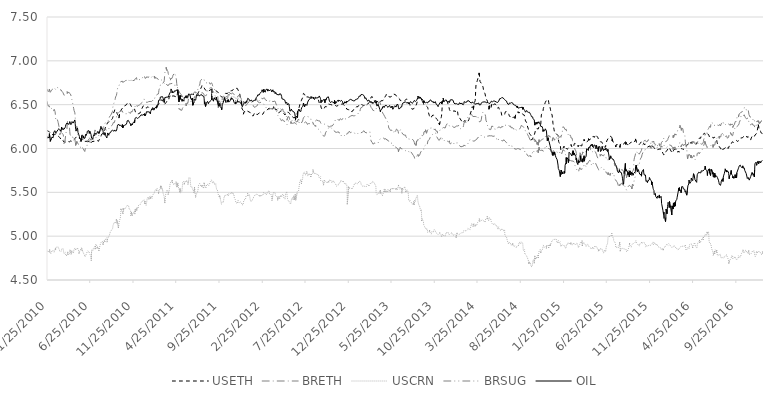
| Category | USETH | BRETH | USCRN | BRSUG | OIL |
|---|---|---|---|---|---|
| 1/25/10 | 6.204 | 6.535 | 4.828 | 6.676 | 6.138 |
| 1/26/10 | 6.201 | 6.519 | 4.837 | 6.667 | 6.133 |
| 1/27/10 | 6.206 | 6.496 | 4.819 | 6.652 | 6.118 |
| 1/28/10 | 6.203 | 6.484 | 4.819 | 6.648 | 6.117 |
| 1/29/10 | 6.197 | 6.479 | 4.831 | 6.642 | 6.107 |
| 2/1/10 | 6.193 | 6.488 | 4.816 | 6.654 | 6.13 |
| 2/2/10 | 6.191 | 6.498 | 4.822 | 6.674 | 6.17 |
| 2/3/10 | 6.186 | 6.484 | 4.842 | 6.663 | 6.168 |
| 2/4/10 | 6.19 | 6.458 | 4.807 | 6.642 | 6.117 |
| 2/5/10 | 6.178 | 6.445 | 4.81 | 6.642 | 6.081 |
| 2/8/10 | 6.171 | 6.452 | 4.804 | 6.652 | 6.088 |
| 2/9/10 | 6.172 | 6.455 | 4.816 | 6.665 | 6.117 |
| 2/10/10 | 6.162 | 6.445 | 4.825 | 6.664 | 6.122 |
| 2/11/10 | 6.159 | 6.445 | 4.834 | 6.664 | 6.129 |
| 2/12/10 | 6.16 | 6.428 | 4.837 | 6.657 | 6.127 |
| 2/15/10 | 6.16 | 6.434 | 4.834 | 6.681 | 6.122 |
| 2/18/10 | 6.157 | 6.433 | 4.828 | 6.681 | 6.192 |
| 2/19/10 | 6.157 | 6.447 | 4.819 | 6.694 | 6.197 |
| 2/22/10 | 6.165 | 6.421 | 4.828 | 6.686 | 6.203 |
| 2/23/10 | 6.162 | 6.392 | 4.862 | 6.677 | 6.185 |
| 2/24/10 | 6.164 | 6.341 | 4.851 | 6.677 | 6.196 |
| 2/25/10 | 6.159 | 6.337 | 4.871 | 6.679 | 6.173 |
| 2/26/10 | 6.155 | 6.352 | 4.86 | 6.691 | 6.19 |
| 3/1/10 | 6.155 | 6.339 | 4.877 | 6.694 | 6.181 |
| 3/2/10 | 6.148 | 6.35 | 4.871 | 6.701 | 6.197 |
| 3/3/10 | 6.152 | 6.335 | 4.871 | 6.695 | 6.211 |
| 3/4/10 | 6.143 | 6.31 | 4.885 | 6.688 | 6.202 |
| 3/5/10 | 6.139 | 6.296 | 4.874 | 6.689 | 6.219 |
| 3/8/10 | 6.135 | 6.25 | 4.854 | 6.679 | 6.226 |
| 3/9/10 | 6.134 | 6.216 | 4.851 | 6.679 | 6.219 |
| 3/10/10 | 6.131 | 6.193 | 4.834 | 6.666 | 6.226 |
| 3/11/10 | 6.123 | 6.161 | 4.825 | 6.673 | 6.224 |
| 3/12/10 | 6.116 | 6.173 | 4.828 | 6.667 | 6.213 |
| 3/15/10 | 6.105 | 6.172 | 4.825 | 6.67 | 6.193 |
| 3/16/10 | 6.095 | 6.182 | 4.822 | 6.667 | 6.208 |
| 3/17/10 | 6.087 | 6.176 | 4.834 | 6.665 | 6.244 |
| 3/18/10 | 6.083 | 6.179 | 4.854 | 6.653 | 6.238 |
| 3/19/10 | 6.086 | 6.171 | 4.862 | 6.645 | 6.219 |
| 3/22/10 | 6.09 | 6.165 | 4.86 | 6.637 | 6.227 |
| 3/23/10 | 6.088 | 6.16 | 4.848 | 6.641 | 6.229 |
| 3/24/10 | 6.082 | 6.153 | 4.825 | 6.63 | 6.215 |
| 3/25/10 | 6.075 | 6.089 | 4.831 | 6.629 | 6.215 |
| 3/26/10 | 6.072 | 6.06 | 4.801 | 6.607 | 6.211 |
| 3/29/10 | 6.069 | 6.085 | 4.804 | 6.616 | 6.235 |
| 3/30/10 | 6.067 | 6.09 | 4.813 | 6.613 | 6.236 |
| 3/31/10 | 6.07 | 6.138 | 4.807 | 6.625 | 6.253 |
| 4/1/10 | 6.074 | 6.168 | 4.78 | 6.633 | 6.269 |
| 4/5/10 | 6.083 | 6.225 | 4.78 | 6.629 | 6.291 |
| 4/6/10 | 6.08 | 6.274 | 4.783 | 6.646 | 6.294 |
| 4/7/10 | 6.083 | 6.311 | 4.786 | 6.632 | 6.288 |
| 4/8/10 | 6.084 | 6.302 | 4.816 | 6.64 | 6.279 |
| 4/9/10 | 6.081 | 6.305 | 4.789 | 6.638 | 6.279 |
| 4/12/10 | 6.073 | 6.297 | 4.783 | 6.642 | 6.278 |
| 4/13/10 | 6.074 | 6.267 | 4.795 | 6.641 | 6.277 |
| 4/14/10 | 6.076 | 6.239 | 4.81 | 6.642 | 6.294 |
| 4/15/10 | 6.078 | 6.195 | 4.825 | 6.628 | 6.306 |
| 4/16/10 | 6.083 | 6.162 | 4.839 | 6.621 | 6.292 |
| 4/19/10 | 6.088 | 6.141 | 4.842 | 6.611 | 6.272 |
| 4/20/10 | 6.081 | 6.123 | 4.798 | 6.573 | 6.278 |
| 4/22/10 | 6.081 | 6.114 | 4.837 | 6.563 | 6.289 |
| 4/23/10 | 6.078 | 6.126 | 4.845 | 6.555 | 6.307 |
| 4/26/10 | 6.081 | 6.13 | 4.819 | 6.503 | 6.302 |
| 4/27/10 | 6.087 | 6.107 | 4.816 | 6.483 | 6.29 |
| 4/28/10 | 6.09 | 6.112 | 4.804 | 6.485 | 6.294 |
| 4/29/10 | 6.099 | 6.119 | 4.831 | 6.455 | 6.303 |
| 4/30/10 | 6.104 | 6.108 | 4.845 | 6.435 | 6.309 |
| 5/3/10 | 6.112 | 6.112 | 4.862 | 6.407 | 6.326 |
| 5/4/10 | 6.122 | 6.084 | 4.854 | 6.37 | 6.289 |
| 5/5/10 | 6.124 | 6.065 | 4.845 | 6.311 | 6.252 |
| 5/6/10 | 6.127 | 6.037 | 4.857 | 6.253 | 6.218 |
| 5/7/10 | 6.128 | 6.032 | 4.851 | 6.239 | 6.198 |
| 5/10/10 | 6.129 | 6.08 | 4.854 | 6.253 | 6.222 |
| 5/11/10 | 6.126 | 6.073 | 4.851 | 6.187 | 6.226 |
| 5/12/10 | 6.125 | 6.072 | 4.868 | 6.185 | 6.235 |
| 5/13/10 | 6.126 | 6.07 | 4.871 | 6.171 | 6.222 |
| 5/14/10 | 6.124 | 6.053 | 4.857 | 6.15 | 6.184 |
| 5/17/10 | 6.117 | 6.047 | 4.828 | 6.133 | 6.157 |
| 5/18/10 | 6.116 | 6.044 | 4.807 | 6.119 | 6.148 |
| 5/19/10 | 6.113 | 6.038 | 4.819 | 6.096 | 6.138 |
| 5/20/10 | 6.112 | 6.016 | 4.816 | 6.079 | 6.113 |
| 5/21/10 | 6.11 | 6.015 | 4.834 | 6.081 | 6.11 |
| 5/24/10 | 6.11 | 6.014 | 4.854 | 6.088 | 6.103 |
| 5/25/10 | 6.108 | 6.001 | 4.86 | 6.09 | 6.08 |
| 5/26/10 | 6.103 | 6.002 | 4.839 | 6.098 | 6.111 |
| 5/27/10 | 6.103 | 6.007 | 4.862 | 6.113 | 6.151 |
| 5/28/10 | 6.103 | 6.013 | 4.865 | 6.126 | 6.142 |
| 5/31/10 | 6.102 | 6.017 | 4.825 | 6.116 | 6.151 |
| 6/1/10 | 6.101 | 6.001 | 4.817 | 6.098 | 6.125 |
| 6/2/10 | 6.098 | 6.008 | 4.81 | 6.098 | 6.139 |
| 6/4/10 | 6.085 | 5.982 | 4.807 | 6.073 | 6.116 |
| 6/7/10 | 6.078 | 5.966 | 4.776 | 6.067 | 6.116 |
| 6/8/10 | 6.08 | 5.984 | 4.764 | 6.084 | 6.119 |
| 6/9/10 | 6.072 | 5.992 | 4.767 | 6.084 | 6.146 |
| 6/10/10 | 6.069 | 6.008 | 4.77 | 6.109 | 6.159 |
| 6/11/10 | 6.071 | 6.011 | 4.786 | 6.099 | 6.147 |
| 6/14/10 | 6.079 | 6.02 | 4.807 | 6.092 | 6.158 |
| 6/15/10 | 6.079 | 6.032 | 4.819 | 6.101 | 6.172 |
| 6/16/10 | 6.08 | 6.075 | 4.819 | 6.112 | 6.197 |
| 6/17/10 | 6.08 | 6.087 | 4.825 | 6.112 | 6.204 |
| 6/18/10 | 6.078 | 6.098 | 4.831 | 6.121 | 6.198 |
| 6/21/10 | 6.082 | 6.106 | 4.839 | 6.119 | 6.205 |
| 6/22/10 | 6.08 | 6.093 | 4.822 | 6.114 | 6.195 |
| 6/23/10 | 6.076 | 6.082 | 4.813 | 6.109 | 6.172 |
| 6/24/10 | 6.071 | 6.072 | 4.798 | 6.113 | 6.175 |
| 6/25/10 | 6.065 | 6.075 | 4.792 | 6.117 | 6.196 |
| 6/28/10 | 6.064 | 6.072 | 4.78 | 6.118 | 6.19 |
| 6/29/10 | 6.061 | 6.061 | 4.755 | 6.093 | 6.161 |
| 6/30/10 | 6.063 | 6.071 | 4.726 | 6.1 | 6.156 |
| 7/1/10 | 6.068 | 6.074 | 4.819 | 6.104 | 6.12 |
| 7/2/10 | 6.077 | 6.069 | 4.848 | 6.116 | 6.11 |
| 7/5/10 | 6.082 | 6.088 | 4.848 | 6.118 | 6.107 |
| 7/6/10 | 6.081 | 6.105 | 4.841 | 6.107 | 6.107 |
| 7/7/10 | 6.076 | 6.14 | 4.834 | 6.123 | 6.136 |
| 7/8/10 | 6.076 | 6.144 | 4.862 | 6.12 | 6.152 |
| 7/12/10 | 6.082 | 6.186 | 4.882 | 6.122 | 6.147 |
| 7/13/10 | 6.086 | 6.212 | 4.871 | 6.129 | 6.177 |
| 7/14/10 | 6.083 | 6.217 | 4.857 | 6.125 | 6.179 |
| 7/15/10 | 6.086 | 6.211 | 4.882 | 6.125 | 6.171 |
| 7/16/10 | 6.09 | 6.195 | 4.907 | 6.123 | 6.161 |
| 7/19/10 | 6.091 | 6.194 | 4.912 | 6.126 | 6.164 |
| 7/20/10 | 6.093 | 6.202 | 4.888 | 6.137 | 6.172 |
| 7/21/10 | 6.089 | 6.189 | 4.865 | 6.133 | 6.161 |
| 7/22/10 | 6.087 | 6.193 | 4.882 | 6.149 | 6.193 |
| 7/23/10 | 6.086 | 6.193 | 4.874 | 6.148 | 6.188 |
| 7/26/10 | 6.083 | 6.185 | 4.857 | 6.145 | 6.188 |
| 7/27/10 | 6.095 | 6.174 | 4.837 | 6.151 | 6.171 |
| 7/28/10 | 6.088 | 6.175 | 4.834 | 6.164 | 6.17 |
| 7/29/10 | 6.098 | 6.194 | 4.871 | 6.181 | 6.19 |
| 7/30/10 | 6.11 | 6.211 | 4.879 | 6.197 | 6.197 |
| 8/2/10 | 6.122 | 6.233 | 4.918 | 6.196 | 6.23 |
| 8/3/10 | 6.131 | 6.229 | 4.912 | 6.203 | 6.253 |
| 8/4/10 | 6.148 | 6.233 | 4.91 | 6.226 | 6.247 |
| 8/5/10 | 6.158 | 6.235 | 4.936 | 6.229 | 6.24 |
| 8/6/10 | 6.164 | 6.23 | 4.934 | 6.228 | 6.222 |
| 8/9/10 | 6.167 | 6.232 | 4.936 | 6.231 | 6.232 |
| 8/10/10 | 6.17 | 6.224 | 4.931 | 6.232 | 6.215 |
| 8/11/10 | 6.173 | 6.217 | 4.907 | 6.227 | 6.19 |
| 8/12/10 | 6.176 | 6.217 | 4.912 | 6.243 | 6.163 |
| 8/13/10 | 6.185 | 6.216 | 4.939 | 6.246 | 6.157 |
| 8/16/10 | 6.194 | 6.224 | 4.955 | 6.278 | 6.154 |
| 8/17/10 | 6.212 | 6.22 | 4.939 | 6.285 | 6.181 |
| 8/18/10 | 6.229 | 6.225 | 4.957 | 6.287 | 6.175 |
| 8/19/10 | 6.242 | 6.222 | 4.968 | 6.295 | 6.16 |
| 8/20/10 | 6.26 | 6.216 | 4.955 | 6.297 | 6.146 |
| 8/23/10 | 6.263 | 6.212 | 4.98 | 6.298 | 6.137 |
| 8/24/10 | 6.273 | 6.207 | 4.968 | 6.298 | 6.12 |
| 8/25/10 | 6.284 | 6.207 | 4.936 | 6.305 | 6.135 |
| 8/26/10 | 6.29 | 6.219 | 4.936 | 6.312 | 6.156 |
| 8/27/10 | 6.292 | 6.224 | 4.973 | 6.316 | 6.177 |
| 8/30/10 | 6.303 | 6.218 | 4.983 | 6.318 | 6.177 |
| 8/31/10 | 6.308 | 6.219 | 4.998 | 6.333 | 6.151 |
| 9/1/10 | 6.305 | 6.226 | 4.99 | 6.345 | 6.173 |
| 9/2/10 | 6.307 | 6.24 | 5.01 | 6.36 | 6.181 |
| 9/3/10 | 6.307 | 6.24 | 5.015 | 6.369 | 6.178 |
| 9/6/10 | 6.31 | 6.248 | 5.056 | 6.377 | 6.18 |
| 9/8/10 | 6.315 | 6.25 | 5.058 | 6.385 | 6.197 |
| 9/9/10 | 6.322 | 6.253 | 5.051 | 6.393 | 6.188 |
| 9/10/10 | 6.331 | 6.26 | 5.07 | 6.403 | 6.197 |
| 9/13/10 | 6.343 | 6.269 | 5.086 | 6.424 | 6.208 |
| 9/14/10 | 6.357 | 6.278 | 5.099 | 6.468 | 6.21 |
| 9/15/10 | 6.364 | 6.274 | 5.123 | 6.47 | 6.206 |
| 9/16/10 | 6.373 | 6.297 | 5.123 | 6.494 | 6.201 |
| 9/17/10 | 6.407 | 6.297 | 5.126 | 6.509 | 6.198 |
| 9/20/10 | 6.428 | 6.297 | 5.162 | 6.519 | 6.212 |
| 9/21/10 | 6.443 | 6.317 | 5.158 | 6.538 | 6.2 |
| 9/22/10 | 6.443 | 6.317 | 5.152 | 6.554 | 6.194 |
| 9/23/10 | 6.443 | 6.321 | 5.152 | 6.573 | 6.196 |
| 9/24/10 | 6.439 | 6.332 | 5.147 | 6.589 | 6.206 |
| 9/27/10 | 6.426 | 6.358 | 5.187 | 6.606 | 6.202 |
| 9/28/10 | 6.417 | 6.384 | 5.168 | 6.625 | 6.204 |
| 9/29/10 | 6.401 | 6.394 | 5.152 | 6.647 | 6.23 |
| 9/30/10 | 6.392 | 6.402 | 5.173 | 6.664 | 6.249 |
| 10/1/10 | 6.387 | 6.407 | 5.164 | 6.687 | 6.266 |
| 10/4/10 | 6.373 | 6.407 | 5.099 | 6.686 | 6.26 |
| 10/5/10 | 6.366 | 6.418 | 5.112 | 6.709 | 6.279 |
| 10/6/10 | 6.351 | 6.412 | 5.154 | 6.715 | 6.281 |
| 10/7/10 | 6.35 | 6.41 | 5.143 | 6.725 | 6.262 |
| 10/8/10 | 6.392 | 6.419 | 5.162 | 6.753 | 6.269 |
| 10/11/10 | 6.408 | 6.419 | 5.213 | 6.753 | 6.266 |
| 10/13/10 | 6.438 | 6.431 | 5.307 | 6.763 | 6.277 |
| 10/14/10 | 6.438 | 6.426 | 5.292 | 6.759 | 6.275 |
| 10/15/10 | 6.449 | 6.426 | 5.289 | 6.762 | 6.25 |
| 10/18/10 | 6.46 | 6.428 | 5.281 | 6.768 | 6.273 |
| 10/19/10 | 6.462 | 6.414 | 5.275 | 6.755 | 6.234 |
| 10/20/10 | 6.467 | 6.418 | 5.26 | 6.763 | 6.264 |
| 10/21/10 | 6.468 | 6.406 | 5.312 | 6.754 | 6.243 |
| 10/22/10 | 6.482 | 6.401 | 5.294 | 6.755 | 6.256 |
| 10/25/10 | 6.484 | 6.4 | 5.287 | 6.764 | 6.263 |
| 10/26/10 | 6.487 | 6.396 | 5.303 | 6.76 | 6.265 |
| 10/27/10 | 6.486 | 6.389 | 5.307 | 6.754 | 6.26 |
| 10/28/10 | 6.488 | 6.393 | 5.325 | 6.767 | 6.264 |
| 10/29/10 | 6.493 | 6.399 | 5.329 | 6.774 | 6.259 |
| 11/1/10 | 6.498 | 6.397 | 5.334 | 6.773 | 6.276 |
| 11/3/10 | 6.508 | 6.402 | 5.323 | 6.778 | 6.297 |
| 11/4/10 | 6.514 | 6.417 | 5.337 | 6.786 | 6.315 |
| 11/5/10 | 6.517 | 6.415 | 5.353 | 6.792 | 6.317 |
| 11/8/10 | 6.521 | 6.414 | 5.35 | 6.797 | 6.321 |
| 11/9/10 | 6.525 | 6.417 | 5.344 | 6.783 | 6.319 |
| 11/10/10 | 6.529 | 6.414 | 5.329 | 6.788 | 6.326 |
| 11/11/10 | 6.526 | 6.41 | 5.312 | 6.788 | 6.325 |
| 11/12/10 | 6.521 | 6.408 | 5.307 | 6.77 | 6.296 |
| 11/16/10 | 6.5 | 6.402 | 5.292 | 6.76 | 6.278 |
| 11/17/10 | 6.494 | 6.41 | 5.237 | 6.769 | 6.26 |
| 11/18/10 | 6.483 | 6.422 | 5.241 | 6.782 | 6.281 |
| 11/19/10 | 6.477 | 6.42 | 5.272 | 6.769 | 6.273 |
| 11/22/10 | 6.47 | 6.42 | 5.231 | 6.761 | 6.268 |
| 11/23/10 | 6.466 | 6.433 | 5.221 | 6.761 | 6.26 |
| 11/24/10 | 6.463 | 6.442 | 5.253 | 6.775 | 6.291 |
| 11/25/10 | 6.461 | 6.448 | 5.272 | 6.784 | 6.294 |
| 11/26/10 | 6.461 | 6.447 | 5.272 | 6.78 | 6.288 |
| 11/29/10 | 6.459 | 6.459 | 5.272 | 6.776 | 6.308 |
| 11/30/10 | 6.45 | 6.464 | 5.274 | 6.781 | 6.292 |
| 12/1/10 | 6.438 | 6.471 | 5.256 | 6.786 | 6.325 |
| 12/2/10 | 6.432 | 6.48 | 5.298 | 6.779 | 6.346 |
| 12/3/10 | 6.418 | 6.493 | 5.283 | 6.798 | 6.354 |
| 12/6/10 | 6.411 | 6.503 | 5.32 | 6.806 | 6.354 |
| 12/7/10 | 6.411 | 6.503 | 5.309 | 6.809 | 6.353 |
| 12/8/10 | 6.406 | 6.494 | 5.298 | 6.789 | 6.346 |
| 12/9/10 | 6.403 | 6.48 | 5.321 | 6.781 | 6.349 |
| 12/10/10 | 6.393 | 6.478 | 5.321 | 6.773 | 6.343 |
| 12/13/10 | 6.392 | 6.489 | 5.32 | 6.779 | 6.351 |
| 12/14/10 | 6.397 | 6.492 | 5.35 | 6.786 | 6.351 |
| 12/15/10 | 6.404 | 6.494 | 5.348 | 6.784 | 6.362 |
| 12/16/10 | 6.405 | 6.494 | 5.341 | 6.777 | 6.357 |
| 12/17/10 | 6.404 | 6.496 | 5.348 | 6.777 | 6.356 |
| 12/20/10 | 6.407 | 6.503 | 5.362 | 6.786 | 6.368 |
| 12/21/10 | 6.414 | 6.509 | 5.367 | 6.792 | 6.373 |
| 12/22/10 | 6.432 | 6.51 | 5.372 | 6.801 | 6.378 |
| 12/23/10 | 6.447 | 6.517 | 5.384 | 6.797 | 6.384 |
| 12/27/10 | 6.46 | 6.526 | 5.393 | 6.802 | 6.38 |
| 12/28/10 | 6.467 | 6.525 | 5.394 | 6.804 | 6.385 |
| 12/29/10 | 6.48 | 6.547 | 5.407 | 6.814 | 6.383 |
| 12/30/10 | 6.48 | 6.558 | 5.407 | 6.822 | 6.372 |
| 1/3/11 | 6.488 | 6.561 | 5.411 | 6.831 | 6.39 |
| 1/4/11 | 6.487 | 6.553 | 5.397 | 6.82 | 6.376 |
| 1/5/11 | 6.486 | 6.54 | 5.377 | 6.815 | 6.397 |
| 1/6/11 | 6.482 | 6.529 | 5.394 | 6.801 | 6.387 |
| 1/7/11 | 6.468 | 6.533 | 5.365 | 6.803 | 6.374 |
| 1/10/11 | 6.464 | 6.528 | 5.353 | 6.805 | 6.399 |
| 1/11/11 | 6.46 | 6.528 | 5.374 | 6.804 | 6.419 |
| 1/12/11 | 6.464 | 6.533 | 5.374 | 6.816 | 6.424 |
| 1/13/11 | 6.471 | 6.537 | 5.414 | 6.821 | 6.424 |
| 1/14/11 | 6.475 | 6.527 | 5.433 | 6.814 | 6.43 |
| 1/17/11 | 6.471 | 6.531 | 5.443 | 6.807 | 6.417 |
| 1/18/11 | 6.472 | 6.534 | 5.449 | 6.814 | 6.421 |
| 1/19/11 | 6.47 | 6.538 | 5.456 | 6.82 | 6.425 |
| 1/20/11 | 6.464 | 6.541 | 5.425 | 6.825 | 6.409 |
| 1/21/11 | 6.46 | 6.544 | 5.446 | 6.822 | 6.419 |
| 1/24/11 | 6.459 | 6.537 | 5.454 | 6.819 | 6.409 |
| 1/25/11 | 6.458 | 6.542 | 5.451 | 6.814 | 6.395 |
| 1/26/11 | 6.453 | 6.547 | 5.433 | 6.821 | 6.422 |
| 1/27/11 | 6.447 | 6.536 | 5.456 | 6.809 | 6.417 |
| 1/28/11 | 6.446 | 6.534 | 5.445 | 6.808 | 6.437 |
| 1/31/11 | 6.444 | 6.541 | 5.433 | 6.81 | 6.453 |
| 2/1/11 | 6.445 | 6.547 | 5.459 | 6.824 | 6.461 |
| 2/2/11 | 6.443 | 6.549 | 5.468 | 6.826 | 6.466 |
| 2/3/11 | 6.445 | 6.546 | 5.473 | 6.826 | 6.461 |
| 2/4/11 | 6.454 | 6.546 | 5.465 | 6.823 | 6.442 |
| 2/7/11 | 6.456 | 6.546 | 5.49 | 6.807 | 6.436 |
| 2/8/11 | 6.459 | 6.563 | 5.483 | 6.823 | 6.443 |
| 2/9/11 | 6.466 | 6.573 | 5.482 | 6.816 | 6.461 |
| 2/10/11 | 6.473 | 6.582 | 5.518 | 6.801 | 6.452 |
| 2/11/11 | 6.477 | 6.595 | 5.519 | 6.814 | 6.458 |
| 2/14/11 | 6.48 | 6.598 | 5.531 | 6.809 | 6.474 |
| 2/15/11 | 6.479 | 6.601 | 5.515 | 6.805 | 6.46 |
| 2/16/11 | 6.479 | 6.605 | 5.511 | 6.797 | 6.48 |
| 2/17/11 | 6.481 | 6.612 | 5.511 | 6.803 | 6.469 |
| 2/18/11 | 6.496 | 6.618 | 5.543 | 6.798 | 6.468 |
| 2/21/11 | 6.501 | 6.621 | 5.538 | 6.793 | 6.499 |
| 2/22/11 | 6.503 | 6.621 | 5.515 | 6.79 | 6.5 |
| 2/23/11 | 6.503 | 6.636 | 5.491 | 6.782 | 6.55 |
| 2/24/11 | 6.5 | 6.662 | 5.509 | 6.772 | 6.551 |
| 2/25/11 | 6.509 | 6.677 | 5.5 | 6.774 | 6.558 |
| 2/28/11 | 6.519 | 6.699 | 5.541 | 6.777 | 6.555 |
| 3/1/11 | 6.53 | 6.717 | 5.554 | 6.776 | 6.587 |
| 3/2/11 | 6.534 | 6.732 | 5.568 | 6.788 | 6.595 |
| 3/3/11 | 6.542 | 6.743 | 5.548 | 6.783 | 6.581 |
| 3/4/11 | 6.553 | 6.743 | 5.57 | 6.785 | 6.591 |
| 3/9/11 | 6.553 | 6.735 | 5.525 | 6.771 | 6.591 |
| 3/10/11 | 6.545 | 6.749 | 5.518 | 6.767 | 6.587 |
| 3/11/11 | 6.535 | 6.755 | 5.488 | 6.758 | 6.573 |
| 3/14/11 | 6.526 | 6.759 | 5.459 | 6.753 | 6.571 |
| 3/15/11 | 6.522 | 6.774 | 5.462 | 6.744 | 6.525 |
| 3/16/11 | 6.505 | 6.819 | 5.414 | 6.738 | 6.544 |
| 3/17/11 | 6.497 | 6.855 | 5.382 | 6.725 | 6.582 |
| 3/18/11 | 6.513 | 6.891 | 5.432 | 6.736 | 6.574 |
| 3/21/11 | 6.522 | 6.905 | 5.493 | 6.73 | 6.583 |
| 3/22/11 | 6.523 | 6.921 | 5.497 | 6.729 | 6.589 |
| 3/23/11 | 6.525 | 6.927 | 5.499 | 6.736 | 6.588 |
| 3/24/11 | 6.53 | 6.913 | 5.49 | 6.736 | 6.589 |
| 3/25/11 | 6.542 | 6.889 | 5.527 | 6.73 | 6.588 |
| 3/28/11 | 6.546 | 6.877 | 5.508 | 6.714 | 6.581 |
| 3/29/11 | 6.544 | 6.857 | 5.479 | 6.714 | 6.584 |
| 3/30/11 | 6.542 | 6.85 | 5.483 | 6.717 | 6.584 |
| 3/31/11 | 6.557 | 6.829 | 5.47 | 6.721 | 6.603 |
| 4/1/11 | 6.579 | 6.807 | 5.515 | 6.734 | 6.615 |
| 4/4/11 | 6.59 | 6.804 | 5.577 | 6.727 | 6.634 |
| 4/5/11 | 6.603 | 6.802 | 5.611 | 6.738 | 6.644 |
| 4/6/11 | 6.603 | 6.784 | 5.62 | 6.732 | 6.645 |
| 4/7/11 | 6.602 | 6.798 | 5.615 | 6.744 | 6.648 |
| 4/8/11 | 6.61 | 6.804 | 5.618 | 6.749 | 6.68 |
| 4/11/11 | 6.615 | 6.799 | 5.622 | 6.742 | 6.658 |
| 4/12/11 | 6.609 | 6.791 | 5.633 | 6.73 | 6.633 |
| 4/13/11 | 6.598 | 6.793 | 5.603 | 6.735 | 6.649 |
| 4/14/11 | 6.601 | 6.824 | 5.607 | 6.734 | 6.645 |
| 4/15/11 | 6.6 | 6.837 | 5.604 | 6.736 | 6.654 |
| 4/18/11 | 6.6 | 6.85 | 5.588 | 6.722 | 6.639 |
| 4/19/11 | 6.598 | 6.864 | 5.601 | 6.725 | 6.637 |
| 4/20/11 | 6.597 | 6.858 | 5.601 | 6.73 | 6.657 |
| 4/25/11 | 6.591 | 6.826 | 5.581 | 6.721 | 6.656 |
| 4/26/11 | 6.592 | 6.816 | 5.616 | 6.724 | 6.66 |
| 4/27/11 | 6.586 | 6.782 | 5.62 | 6.712 | 6.667 |
| 4/28/11 | 6.583 | 6.741 | 5.605 | 6.697 | 6.667 |
| 4/29/11 | 6.586 | 6.721 | 5.564 | 6.699 | 6.674 |
| 5/2/11 | 6.665 | 6.689 | 5.603 | 6.694 | 6.667 |
| 5/3/11 | 6.593 | 6.635 | 5.574 | 6.687 | 6.646 |
| 5/4/11 | 6.595 | 6.57 | 5.558 | 6.677 | 6.635 |
| 5/5/11 | 6.595 | 6.477 | 5.567 | 6.658 | 6.546 |
| 5/6/11 | 6.598 | 6.448 | 5.54 | 6.656 | 6.531 |
| 5/9/11 | 6.598 | 6.446 | 5.506 | 6.635 | 6.591 |
| 5/10/11 | 6.595 | 6.451 | 5.54 | 6.639 | 6.606 |
| 5/11/11 | 6.598 | 6.439 | 5.541 | 6.638 | 6.562 |
| 5/12/11 | 6.598 | 6.441 | 5.497 | 6.633 | 6.565 |
| 5/13/11 | 6.598 | 6.435 | 5.506 | 6.616 | 6.573 |
| 5/16/11 | 6.597 | 6.436 | 5.508 | 6.611 | 6.563 |
| 5/17/11 | 6.597 | 6.446 | 5.531 | 6.603 | 6.539 |
| 5/18/11 | 6.597 | 6.456 | 5.57 | 6.608 | 6.559 |
| 5/19/11 | 6.597 | 6.459 | 5.611 | 6.606 | 6.551 |
| 5/20/11 | 6.598 | 6.468 | 5.608 | 6.581 | 6.56 |
| 5/23/11 | 6.599 | 6.475 | 5.624 | 6.554 | 6.54 |
| 5/24/11 | 6.589 | 6.49 | 5.616 | 6.545 | 6.561 |
| 5/25/11 | 6.589 | 6.483 | 5.596 | 6.536 | 6.582 |
| 5/26/11 | 6.586 | 6.489 | 5.608 | 6.544 | 6.584 |
| 5/27/11 | 6.597 | 6.499 | 5.614 | 6.538 | 6.583 |
| 5/30/11 | 6.599 | 6.498 | 5.631 | 6.535 | 6.58 |
| 5/31/11 | 6.6 | 6.511 | 5.624 | 6.542 | 6.598 |
| 6/1/11 | 6.6 | 6.491 | 5.616 | 6.529 | 6.579 |
| 6/2/11 | 6.6 | 6.508 | 5.631 | 6.54 | 6.588 |
| 6/3/11 | 6.599 | 6.509 | 5.641 | 6.527 | 6.59 |
| 6/6/11 | 6.601 | 6.514 | 5.624 | 6.521 | 6.579 |
| 6/7/11 | 6.595 | 6.526 | 5.595 | 6.523 | 6.598 |
| 6/8/11 | 6.599 | 6.552 | 5.601 | 6.524 | 6.608 |
| 6/9/11 | 6.608 | 6.584 | 5.637 | 6.522 | 6.622 |
| 6/10/11 | 6.612 | 6.589 | 5.666 | 6.521 | 6.615 |
| 6/13/11 | 6.617 | 6.606 | 5.673 | 6.526 | 6.618 |
| 6/14/11 | 6.623 | 6.625 | 5.668 | 6.533 | 6.627 |
| 6/15/11 | 6.619 | 6.616 | 5.633 | 6.527 | 6.601 |
| 6/16/11 | 6.618 | 6.612 | 5.593 | 6.524 | 6.575 |
| 6/17/11 | 6.616 | 6.62 | 5.56 | 6.533 | 6.567 |
| 6/20/11 | 6.62 | 6.622 | 5.557 | 6.537 | 6.554 |
| 6/21/11 | 6.619 | 6.627 | 5.558 | 6.547 | 6.547 |
| 6/22/11 | 6.622 | 6.626 | 5.568 | 6.552 | 6.576 |
| 6/24/11 | 6.613 | 6.615 | 5.53 | 6.55 | 6.493 |
| 6/27/11 | 6.615 | 6.624 | 5.514 | 6.552 | 6.501 |
| 6/28/11 | 6.618 | 6.634 | 5.5 | 6.571 | 6.527 |
| 6/29/11 | 6.621 | 6.642 | 5.533 | 6.578 | 6.56 |
| 6/30/11 | 6.617 | 6.646 | 5.554 | 6.589 | 6.561 |
| 7/1/11 | 6.615 | 6.647 | 5.511 | 6.596 | 6.555 |
| 7/4/11 | 6.612 | 6.644 | 5.448 | 6.613 | 6.551 |
| 7/5/11 | 6.609 | 6.63 | 5.463 | 6.614 | 6.571 |
| 7/6/11 | 6.619 | 6.624 | 5.477 | 6.618 | 6.571 |
| 7/7/11 | 6.617 | 6.632 | 5.474 | 6.649 | 6.614 |
| 7/8/11 | 6.616 | 6.621 | 5.483 | 6.658 | 6.612 |
| 7/11/11 | 6.62 | 6.611 | 5.509 | 6.66 | 6.602 |
| 7/12/11 | 6.627 | 6.612 | 5.511 | 6.686 | 6.607 |
| 7/13/11 | 6.635 | 6.621 | 5.541 | 6.694 | 6.615 |
| 7/14/11 | 6.646 | 6.62 | 5.574 | 6.711 | 6.612 |
| 7/15/11 | 6.649 | 6.623 | 5.586 | 6.717 | 6.603 |
| 7/18/11 | 6.649 | 6.62 | 5.6 | 6.721 | 6.592 |
| 7/19/11 | 6.654 | 6.625 | 5.593 | 6.739 | 6.601 |
| 7/20/11 | 6.667 | 6.627 | 5.596 | 6.761 | 6.61 |
| 7/21/11 | 6.674 | 6.637 | 5.582 | 6.773 | 6.605 |
| 7/22/11 | 6.685 | 6.637 | 5.57 | 6.779 | 6.614 |
| 7/25/11 | 6.704 | 6.634 | 5.585 | 6.789 | 6.608 |
| 7/26/11 | 6.717 | 6.642 | 5.57 | 6.794 | 6.611 |
| 7/27/11 | 6.724 | 6.632 | 5.585 | 6.782 | 6.604 |
| 7/28/11 | 6.726 | 6.625 | 5.588 | 6.78 | 6.603 |
| 7/29/11 | 6.721 | 6.636 | 5.574 | 6.798 | 6.598 |
| 8/1/11 | 6.712 | 6.629 | 5.544 | 6.794 | 6.599 |
| 8/2/11 | 6.699 | 6.618 | 5.565 | 6.795 | 6.596 |
| 8/3/11 | 6.69 | 6.625 | 5.604 | 6.785 | 6.568 |
| 8/4/11 | 6.696 | 6.612 | 5.597 | 6.774 | 6.513 |
| 8/5/11 | 6.68 | 6.615 | 5.577 | 6.771 | 6.533 |
| 8/8/11 | 6.671 | 6.598 | 5.572 | 6.751 | 6.48 |
| 8/9/11 | 6.662 | 6.599 | 5.547 | 6.753 | 6.469 |
| 8/10/11 | 6.658 | 6.603 | 5.551 | 6.747 | 6.508 |
| 8/11/11 | 6.656 | 6.61 | 5.551 | 6.746 | 6.52 |
| 8/12/11 | 6.66 | 6.619 | 5.586 | 6.749 | 6.521 |
| 8/15/11 | 6.651 | 6.643 | 5.585 | 6.763 | 6.538 |
| 8/16/11 | 6.65 | 6.668 | 5.592 | 6.754 | 6.534 |
| 8/17/11 | 6.65 | 6.682 | 5.601 | 6.751 | 6.544 |
| 8/18/11 | 6.65 | 6.673 | 5.595 | 6.744 | 6.511 |
| 8/19/11 | 6.65 | 6.681 | 5.577 | 6.747 | 6.526 |
| 8/22/11 | 6.659 | 6.686 | 5.593 | 6.75 | 6.524 |
| 8/23/11 | 6.666 | 6.691 | 5.607 | 6.748 | 6.532 |
| 8/24/11 | 6.667 | 6.688 | 5.619 | 6.733 | 6.54 |
| 8/25/11 | 6.667 | 6.687 | 5.622 | 6.736 | 6.544 |
| 8/26/11 | 6.672 | 6.692 | 5.62 | 6.736 | 6.551 |
| 8/29/11 | 6.675 | 6.697 | 5.64 | 6.749 | 6.556 |
| 8/30/11 | 6.559 | 6.692 | 5.644 | 6.752 | 6.575 |
| 8/31/11 | 6.671 | 6.687 | 5.65 | 6.744 | 6.582 |
| 9/1/11 | 6.669 | 6.676 | 5.641 | 6.731 | 6.577 |
| 9/2/11 | 6.667 | 6.658 | 5.603 | 6.715 | 6.56 |
| 9/5/11 | 6.669 | 6.645 | 5.624 | 6.7 | 6.539 |
| 9/6/11 | 6.669 | 6.635 | 5.622 | 6.692 | 6.565 |
| 9/8/11 | 6.669 | 6.637 | 5.605 | 6.695 | 6.579 |
| 9/9/11 | 6.665 | 6.616 | 5.586 | 6.671 | 6.563 |
| 9/12/11 | 6.666 | 6.594 | 5.588 | 6.646 | 6.559 |
| 9/13/11 | 6.659 | 6.597 | 5.6 | 6.648 | 6.556 |
| 9/14/11 | 6.657 | 6.591 | 5.568 | 6.642 | 6.56 |
| 9/15/11 | 6.654 | 6.598 | 5.57 | 6.639 | 6.586 |
| 9/16/11 | 6.652 | 6.586 | 5.537 | 6.625 | 6.559 |
| 9/19/11 | 6.649 | 6.548 | 5.524 | 6.607 | 6.531 |
| 9/20/11 | 6.64 | 6.534 | 5.524 | 6.594 | 6.544 |
| 9/21/11 | 6.639 | 6.505 | 5.521 | 6.562 | 6.542 |
| 9/22/11 | 6.636 | 6.468 | 5.515 | 6.517 | 6.497 |
| 9/23/11 | 6.626 | 6.499 | 5.46 | 6.53 | 6.482 |
| 9/26/11 | 6.619 | 6.502 | 5.443 | 6.544 | 6.482 |
| 9/27/11 | 6.615 | 6.517 | 5.457 | 6.546 | 6.512 |
| 9/28/11 | 6.61 | 6.51 | 5.463 | 6.528 | 6.481 |
| 9/29/11 | 6.606 | 6.494 | 5.43 | 6.515 | 6.482 |
| 9/30/11 | 6.603 | 6.482 | 5.433 | 6.503 | 6.471 |
| 10/3/11 | 6.589 | 6.487 | 5.367 | 6.499 | 6.46 |
| 10/4/11 | 6.586 | 6.49 | 5.37 | 6.498 | 6.441 |
| 10/5/11 | 6.582 | 6.525 | 5.362 | 6.524 | 6.47 |
| 10/6/11 | 6.585 | 6.57 | 5.392 | 6.546 | 6.499 |
| 10/7/11 | 6.586 | 6.581 | 5.396 | 6.558 | 6.5 |
| 10/10/11 | 6.589 | 6.58 | 5.387 | 6.557 | 6.529 |
| 10/11/11 | 6.597 | 6.588 | 5.396 | 6.559 | 6.545 |
| 10/13/11 | 6.608 | 6.589 | 5.457 | 6.558 | 6.549 |
| 10/14/11 | 6.616 | 6.6 | 5.452 | 6.579 | 6.58 |
| 10/17/11 | 6.626 | 6.584 | 5.456 | 6.561 | 6.54 |
| 10/18/11 | 6.63 | 6.587 | 5.462 | 6.568 | 6.549 |
| 10/19/11 | 6.63 | 6.584 | 5.47 | 6.564 | 6.524 |
| 10/20/11 | 6.629 | 6.576 | 5.462 | 6.55 | 6.536 |
| 10/21/11 | 6.623 | 6.588 | 5.479 | 6.57 | 6.535 |
| 10/24/11 | 6.626 | 6.606 | 5.477 | 6.581 | 6.552 |
| 10/25/11 | 6.626 | 6.605 | 5.48 | 6.571 | 6.547 |
| 10/26/11 | 6.629 | 6.61 | 5.48 | 6.577 | 6.529 |
| 10/27/11 | 6.633 | 6.646 | 5.459 | 6.614 | 6.557 |
| 10/28/11 | 6.64 | 6.661 | 5.482 | 6.623 | 6.538 |
| 10/31/11 | 6.644 | 6.651 | 5.486 | 6.618 | 6.535 |
| 11/1/11 | 6.655 | 6.633 | 5.474 | 6.593 | 6.534 |
| 11/3/11 | 6.657 | 6.627 | 5.476 | 6.586 | 6.546 |
| 11/4/11 | 6.66 | 6.627 | 5.49 | 6.594 | 6.556 |
| 11/7/11 | 6.659 | 6.623 | 5.496 | 6.583 | 6.579 |
| 11/8/11 | 6.659 | 6.629 | 5.491 | 6.584 | 6.583 |
| 11/9/11 | 6.659 | 6.616 | 5.503 | 6.579 | 6.559 |
| 11/10/11 | 6.661 | 6.62 | 5.496 | 6.591 | 6.572 |
| 11/11/11 | 6.661 | 6.635 | 5.48 | 6.606 | 6.576 |
| 11/14/11 | 6.675 | 6.623 | 5.47 | 6.596 | 6.556 |
| 11/16/11 | 6.684 | 6.62 | 5.482 | 6.593 | 6.556 |
| 11/17/11 | 6.685 | 6.615 | 5.477 | 6.581 | 6.522 |
| 11/18/11 | 6.691 | 6.615 | 5.433 | 6.574 | 6.516 |
| 11/21/11 | 6.69 | 6.604 | 5.417 | 6.564 | 6.51 |
| 11/22/11 | 6.686 | 6.601 | 5.397 | 6.562 | 6.53 |
| 11/23/11 | 6.684 | 6.577 | 5.399 | 6.532 | 6.511 |
| 11/24/11 | 6.684 | 6.577 | 5.382 | 6.522 | 6.518 |
| 11/25/11 | 6.684 | 6.56 | 5.377 | 6.521 | 6.505 |
| 11/28/11 | 6.686 | 6.575 | 5.372 | 6.538 | 6.529 |
| 11/29/11 | 6.682 | 6.579 | 5.387 | 6.545 | 6.546 |
| 11/30/11 | 6.677 | 6.597 | 5.397 | 6.567 | 6.543 |
| 12/1/11 | 6.667 | 6.603 | 5.407 | 6.569 | 6.529 |
| 12/2/11 | 6.657 | 6.606 | 5.396 | 6.57 | 6.538 |
| 12/5/11 | 6.639 | 6.607 | 5.379 | 6.576 | 6.537 |
| 12/6/11 | 6.634 | 6.603 | 5.372 | 6.569 | 6.546 |
| 12/7/11 | 6.62 | 6.601 | 5.382 | 6.567 | 6.534 |
| 12/8/11 | 6.604 | 6.593 | 5.377 | 6.56 | 6.521 |
| 12/9/11 | 6.57 | 6.596 | 5.389 | 6.56 | 6.526 |
| 12/12/11 | 6.559 | 6.569 | 5.379 | 6.538 | 6.513 |
| 12/13/11 | 6.506 | 6.566 | 5.379 | 6.536 | 6.534 |
| 12/14/11 | 6.481 | 6.55 | 5.381 | 6.519 | 6.492 |
| 12/15/11 | 6.45 | 6.555 | 5.357 | 6.531 | 6.493 |
| 12/16/11 | 6.443 | 6.551 | 5.353 | 6.528 | 6.476 |
| 12/19/11 | 6.438 | 6.537 | 5.36 | 6.524 | 6.479 |
| 12/20/11 | 6.395 | 6.545 | 5.391 | 6.537 | 6.508 |
| 12/21/11 | 6.407 | 6.537 | 5.397 | 6.524 | 6.518 |
| 12/22/11 | 6.413 | 6.539 | 5.414 | 6.521 | 6.519 |
| 12/23/11 | 6.422 | 6.531 | 5.416 | 6.515 | 6.52 |
| 12/27/11 | 6.419 | 6.51 | 5.419 | 6.518 | 6.532 |
| 12/28/11 | 6.431 | 6.488 | 5.44 | 6.514 | 6.516 |
| 12/29/11 | 6.423 | 6.491 | 5.456 | 6.52 | 6.52 |
| 1/3/12 | 6.427 | 6.512 | 5.462 | 6.538 | 6.558 |
| 1/4/12 | 6.427 | 6.519 | 5.483 | 6.541 | 6.572 |
| 1/5/12 | 6.429 | 6.521 | 5.485 | 6.529 | 6.563 |
| 1/6/12 | 6.418 | 6.521 | 5.462 | 6.52 | 6.566 |
| 1/9/12 | 6.416 | 6.534 | 5.462 | 6.519 | 6.561 |
| 1/10/12 | 6.423 | 6.555 | 5.474 | 6.539 | 6.568 |
| 1/11/12 | 6.42 | 6.555 | 5.476 | 6.542 | 6.559 |
| 1/12/12 | 6.412 | 6.563 | 5.476 | 6.551 | 6.55 |
| 1/13/12 | 6.41 | 6.557 | 5.412 | 6.54 | 6.543 |
| 1/16/12 | 6.403 | 6.55 | 5.392 | 6.537 | 6.549 |
| 1/17/12 | 6.394 | 6.546 | 5.396 | 6.536 | 6.552 |
| 1/18/12 | 6.378 | 6.53 | 5.399 | 6.542 | 6.545 |
| 1/19/12 | 6.374 | 6.506 | 5.386 | 6.542 | 6.553 |
| 1/20/12 | 6.374 | 6.502 | 5.412 | 6.549 | 6.537 |
| 1/23/12 | 6.37 | 6.497 | 5.422 | 6.555 | 6.544 |
| 1/24/12 | 6.371 | 6.481 | 5.435 | 6.547 | 6.539 |
| 1/25/12 | 6.384 | 6.482 | 5.451 | 6.549 | 6.537 |
| 1/26/12 | 6.387 | 6.482 | 5.457 | 6.562 | 6.546 |
| 1/27/12 | 6.397 | 6.481 | 5.457 | 6.563 | 6.552 |
| 1/30/12 | 6.406 | 6.468 | 5.47 | 6.559 | 6.545 |
| 1/31/12 | 6.408 | 6.47 | 5.459 | 6.559 | 6.547 |
| 2/1/12 | 6.399 | 6.478 | 5.47 | 6.562 | 6.553 |
| 2/2/12 | 6.393 | 6.473 | 5.474 | 6.569 | 6.557 |
| 2/3/12 | 6.392 | 6.484 | 5.476 | 6.572 | 6.579 |
| 2/6/12 | 6.387 | 6.475 | 5.479 | 6.548 | 6.591 |
| 2/7/12 | 6.387 | 6.489 | 5.477 | 6.544 | 6.594 |
| 2/8/12 | 6.395 | 6.492 | 5.474 | 6.541 | 6.602 |
| 2/9/12 | 6.394 | 6.497 | 5.476 | 6.54 | 6.614 |
| 2/10/12 | 6.392 | 6.522 | 5.468 | 6.529 | 6.603 |
| 2/13/12 | 6.398 | 6.542 | 5.459 | 6.531 | 6.608 |
| 2/14/12 | 6.407 | 6.551 | 5.471 | 6.522 | 6.61 |
| 2/15/12 | 6.403 | 6.56 | 5.462 | 6.519 | 6.617 |
| 2/16/12 | 6.398 | 6.564 | 5.451 | 6.521 | 6.627 |
| 2/17/12 | 6.395 | 6.567 | 5.465 | 6.525 | 6.622 |
| 2/22/12 | 6.387 | 6.572 | 5.456 | 6.529 | 6.65 |
| 2/23/12 | 6.386 | 6.566 | 5.468 | 6.523 | 6.655 |
| 2/24/12 | 6.389 | 6.566 | 5.471 | 6.525 | 6.67 |
| 2/27/12 | 6.392 | 6.566 | 5.473 | 6.519 | 6.66 |
| 2/28/12 | 6.398 | 6.574 | 5.479 | 6.519 | 6.638 |
| 2/29/12 | 6.406 | 6.571 | 5.496 | 6.508 | 6.648 |
| 3/1/12 | 6.412 | 6.58 | 5.497 | 6.513 | 6.676 |
| 3/2/12 | 6.419 | 6.571 | 5.491 | 6.499 | 6.656 |
| 3/5/12 | 6.423 | 6.57 | 5.493 | 6.495 | 6.657 |
| 3/6/12 | 6.429 | 6.557 | 5.502 | 6.48 | 6.642 |
| 3/7/12 | 6.425 | 6.561 | 5.493 | 6.474 | 6.659 |
| 3/8/12 | 6.422 | 6.561 | 5.47 | 6.476 | 6.67 |
| 3/9/12 | 6.429 | 6.556 | 5.465 | 6.469 | 6.674 |
| 3/12/12 | 6.436 | 6.545 | 5.479 | 6.454 | 6.669 |
| 3/13/12 | 6.441 | 6.548 | 5.502 | 6.451 | 6.676 |
| 3/14/12 | 6.438 | 6.539 | 5.505 | 6.442 | 6.666 |
| 3/15/12 | 6.443 | 6.54 | 5.497 | 6.445 | 6.655 |
| 3/16/12 | 6.45 | 6.543 | 5.512 | 6.446 | 6.673 |
| 3/19/12 | 6.459 | 6.539 | 5.518 | 6.445 | 6.672 |
| 3/20/12 | 6.461 | 6.531 | 5.505 | 6.437 | 6.659 |
| 3/21/12 | 6.45 | 6.533 | 5.48 | 6.441 | 6.66 |
| 3/22/12 | 6.441 | 6.533 | 5.471 | 6.441 | 6.651 |
| 3/23/12 | 6.441 | 6.555 | 5.476 | 6.454 | 6.667 |
| 3/26/12 | 6.449 | 6.548 | 5.479 | 6.453 | 6.672 |
| 3/27/12 | 6.448 | 6.547 | 5.465 | 6.454 | 6.671 |
| 3/28/12 | 6.448 | 6.538 | 5.454 | 6.45 | 6.66 |
| 3/29/12 | 6.443 | 6.538 | 5.437 | 6.456 | 6.645 |
| 3/30/12 | 6.452 | 6.537 | 5.411 | 6.456 | 6.649 |
| 4/2/12 | 6.456 | 6.534 | 5.474 | 6.455 | 6.67 |
| 4/3/12 | 6.454 | 6.536 | 5.494 | 6.455 | 6.665 |
| 4/4/12 | 6.461 | 6.538 | 5.499 | 6.458 | 6.645 |
| 4/5/12 | 6.486 | 6.539 | 5.499 | 6.461 | 6.654 |
| 4/9/12 | 6.46 | 6.542 | 5.5 | 6.466 | 6.648 |
| 4/10/12 | 6.455 | 6.534 | 5.486 | 6.463 | 6.625 |
| 4/11/12 | 6.442 | 6.529 | 5.465 | 6.46 | 6.627 |
| 4/12/12 | 6.439 | 6.523 | 5.466 | 6.458 | 6.64 |
| 4/13/12 | 6.431 | 6.508 | 5.466 | 6.435 | 6.641 |
| 4/16/12 | 6.444 | 6.5 | 5.454 | 6.424 | 6.615 |
| 4/17/12 | 6.439 | 6.482 | 5.443 | 6.412 | 6.615 |
| 4/18/12 | 6.418 | 6.465 | 5.435 | 6.396 | 6.609 |
| 4/19/12 | 6.409 | 6.459 | 5.414 | 6.379 | 6.609 |
| 4/20/12 | 6.406 | 6.46 | 5.443 | 6.377 | 6.615 |
| 4/23/12 | 6.405 | 6.445 | 5.429 | 6.365 | 6.615 |
| 4/24/12 | 6.408 | 6.443 | 5.448 | 6.359 | 6.61 |
| 4/25/12 | 6.405 | 6.445 | 5.44 | 6.357 | 6.618 |
| 4/26/12 | 6.403 | 6.452 | 5.429 | 6.349 | 6.625 |
| 4/27/12 | 6.406 | 6.458 | 5.44 | 6.34 | 6.624 |
| 4/30/12 | 6.43 | 6.452 | 5.468 | 6.329 | 6.621 |
| 5/2/12 | 6.435 | 6.444 | 5.474 | 6.316 | 6.611 |
| 5/3/12 | 6.434 | 6.454 | 5.448 | 6.323 | 6.592 |
| 5/4/12 | 6.428 | 6.451 | 5.46 | 6.324 | 6.567 |
| 5/7/12 | 6.417 | 6.45 | 5.479 | 6.329 | 6.567 |
| 5/8/12 | 6.415 | 6.435 | 5.479 | 6.324 | 6.563 |
| 5/9/12 | 6.413 | 6.42 | 5.488 | 6.316 | 6.567 |
| 5/10/12 | 6.404 | 6.429 | 5.463 | 6.323 | 6.563 |
| 5/11/12 | 6.398 | 6.424 | 5.433 | 6.322 | 6.559 |
| 5/14/12 | 6.393 | 6.413 | 5.422 | 6.308 | 6.553 |
| 5/15/12 | 6.382 | 6.406 | 5.425 | 6.305 | 6.559 |
| 5/16/12 | 6.395 | 6.39 | 5.448 | 6.309 | 6.554 |
| 5/17/12 | 6.403 | 6.389 | 5.483 | 6.311 | 6.516 |
| 5/18/12 | 6.412 | 6.373 | 5.491 | 6.3 | 6.512 |
| 5/21/12 | 6.417 | 6.359 | 5.508 | 6.291 | 6.528 |
| 5/22/12 | 6.416 | 6.327 | 5.503 | 6.274 | 6.524 |
| 5/23/12 | 6.413 | 6.34 | 5.44 | 6.288 | 6.497 |
| 5/24/12 | 6.41 | 6.342 | 5.451 | 6.292 | 6.507 |
| 5/25/12 | 6.408 | 6.362 | 5.411 | 6.312 | 6.509 |
| 5/28/12 | 6.41 | 6.37 | 5.411 | 6.319 | 6.512 |
| 5/29/12 | 6.412 | 6.363 | 5.397 | 6.318 | 6.508 |
| 5/30/12 | 6.406 | 6.347 | 5.384 | 6.303 | 6.477 |
| 5/31/12 | 6.397 | 6.335 | 5.379 | 6.307 | 6.462 |
| 6/1/12 | 6.394 | 6.32 | 5.376 | 6.295 | 6.427 |
| 6/4/12 | 6.379 | 6.312 | 5.365 | 6.285 | 6.432 |
| 6/5/12 | 6.374 | 6.331 | 5.392 | 6.303 | 6.432 |
| 6/6/12 | 6.363 | 6.326 | 5.392 | 6.29 | 6.45 |
| 6/8/12 | 6.361 | 6.323 | 5.438 | 6.293 | 6.438 |
| 6/11/12 | 6.361 | 6.312 | 5.445 | 6.287 | 6.423 |
| 6/12/12 | 6.358 | 6.308 | 5.435 | 6.289 | 6.414 |
| 6/13/12 | 6.351 | 6.305 | 5.422 | 6.283 | 6.414 |
| 6/14/12 | 6.349 | 6.312 | 5.441 | 6.286 | 6.413 |
| 6/15/12 | 6.349 | 6.32 | 5.456 | 6.291 | 6.419 |
| 6/18/12 | 6.35 | 6.311 | 5.42 | 6.282 | 6.403 |
| 6/19/12 | 6.355 | 6.325 | 5.452 | 6.295 | 6.4 |
| 6/20/12 | 6.354 | 6.322 | 5.473 | 6.29 | 6.367 |
| 6/21/12 | 6.351 | 6.314 | 5.471 | 6.285 | 6.329 |
| 6/22/12 | 6.354 | 6.309 | 5.414 | 6.282 | 6.349 |
| 6/25/12 | 6.37 | 6.312 | 5.42 | 6.283 | 6.349 |
| 6/26/12 | 6.388 | 6.302 | 5.483 | 6.273 | 6.371 |
| 6/27/12 | 6.402 | 6.294 | 5.506 | 6.27 | 6.376 |
| 6/28/12 | 6.413 | 6.293 | 5.512 | 6.273 | 6.353 |
| 6/29/12 | 6.424 | 6.324 | 5.512 | 6.308 | 6.421 |
| 7/2/12 | 6.437 | 6.336 | 5.519 | 6.324 | 6.416 |
| 7/3/12 | 6.46 | 6.314 | 5.553 | 6.304 | 6.45 |
| 7/4/12 | 6.468 | 6.303 | 5.57 | 6.292 | 6.441 |
| 7/5/12 | 6.483 | 6.31 | 5.594 | 6.287 | 6.45 |
| 7/6/12 | 6.5 | 6.308 | 5.618 | 6.283 | 6.425 |
| 7/10/12 | 6.533 | 6.298 | 5.648 | 6.28 | 6.423 |
| 7/11/12 | 6.54 | 6.295 | 5.631 | 6.29 | 6.446 |
| 7/12/12 | 6.551 | 6.294 | 5.6 | 6.287 | 6.454 |
| 7/13/12 | 6.561 | 6.296 | 5.636 | 6.297 | 6.467 |
| 7/16/12 | 6.579 | 6.295 | 5.649 | 6.314 | 6.478 |
| 7/17/12 | 6.593 | 6.298 | 5.695 | 6.329 | 6.483 |
| 7/18/12 | 6.609 | 6.299 | 5.698 | 6.336 | 6.494 |
| 7/19/12 | 6.629 | 6.306 | 5.717 | 6.351 | 6.518 |
| 7/20/12 | 6.626 | 6.3 | 5.713 | 6.36 | 6.509 |
| 7/23/12 | 6.618 | 6.295 | 5.733 | 6.364 | 6.475 |
| 7/24/12 | 6.613 | 6.29 | 5.721 | 6.362 | 6.477 |
| 7/25/12 | 6.599 | 6.298 | 5.698 | 6.369 | 6.486 |
| 7/26/12 | 6.595 | 6.305 | 5.706 | 6.375 | 6.495 |
| 7/27/12 | 6.582 | 6.303 | 5.691 | 6.376 | 6.506 |
| 7/30/12 | 6.581 | 6.295 | 5.707 | 6.373 | 6.503 |
| 7/31/12 | 6.588 | 6.292 | 5.732 | 6.367 | 6.491 |
| 8/1/12 | 6.585 | 6.29 | 5.717 | 6.365 | 6.501 |
| 8/2/12 | 6.581 | 6.275 | 5.709 | 6.358 | 6.501 |
| 8/3/12 | 6.579 | 6.283 | 5.688 | 6.366 | 6.529 |
| 8/6/12 | 6.588 | 6.284 | 5.708 | 6.361 | 6.535 |
| 8/7/12 | 6.586 | 6.274 | 5.7 | 6.354 | 6.557 |
| 8/8/12 | 6.583 | 6.274 | 5.696 | 6.354 | 6.558 |
| 8/9/12 | 6.576 | 6.276 | 5.714 | 6.357 | 6.567 |
| 8/10/12 | 6.584 | 6.284 | 5.723 | 6.353 | 6.565 |
| 8/13/12 | 6.58 | 6.274 | 5.701 | 6.351 | 6.571 |
| 8/14/12 | 6.582 | 6.272 | 5.68 | 6.342 | 6.575 |
| 8/15/12 | 6.573 | 6.275 | 5.681 | 6.32 | 6.594 |
| 8/16/12 | 6.573 | 6.279 | 5.704 | 6.308 | 6.599 |
| 8/17/12 | 6.575 | 6.28 | 5.715 | 6.305 | 6.572 |
| 8/20/12 | 6.583 | 6.279 | 5.717 | 6.305 | 6.572 |
| 8/21/12 | 6.585 | 6.281 | 5.736 | 6.295 | 6.58 |
| 8/22/12 | 6.587 | 6.282 | 5.755 | 6.29 | 6.582 |
| 8/23/12 | 6.581 | 6.283 | 5.75 | 6.281 | 6.583 |
| 8/24/12 | 6.579 | 6.283 | 5.727 | 6.273 | 6.571 |
| 8/27/12 | 6.576 | 6.286 | 5.719 | 6.265 | 6.559 |
| 8/28/12 | 6.575 | 6.298 | 5.708 | 6.263 | 6.562 |
| 8/29/12 | 6.573 | 6.292 | 5.706 | 6.257 | 6.561 |
| 8/30/12 | 6.58 | 6.313 | 5.72 | 6.251 | 6.562 |
| 8/31/12 | 6.583 | 6.321 | 5.717 | 6.264 | 6.579 |
| 9/3/12 | 6.584 | 6.324 | 5.706 | 6.264 | 6.59 |
| 9/4/12 | 6.583 | 6.316 | 5.708 | 6.243 | 6.576 |
| 9/5/12 | 6.573 | 6.321 | 5.712 | 6.234 | 6.566 |
| 9/6/12 | 6.564 | 6.319 | 5.695 | 6.231 | 6.57 |
| 9/10/12 | 6.552 | 6.316 | 5.702 | 6.221 | 6.581 |
| 9/11/12 | 6.546 | 6.322 | 5.681 | 6.215 | 6.587 |
| 9/12/12 | 6.531 | 6.319 | 5.676 | 6.214 | 6.591 |
| 9/13/12 | 6.517 | 6.318 | 5.666 | 6.215 | 6.599 |
| 9/14/12 | 6.513 | 6.316 | 5.671 | 6.205 | 6.597 |
| 9/17/12 | 6.513 | 6.299 | 5.678 | 6.189 | 6.572 |
| 9/18/12 | 6.491 | 6.294 | 5.635 | 6.198 | 6.557 |
| 9/19/12 | 6.482 | 6.286 | 5.624 | 6.2 | 6.522 |
| 9/20/12 | 6.462 | 6.285 | 5.644 | 6.197 | 6.539 |
| 9/21/12 | 6.456 | 6.282 | 5.627 | 6.178 | 6.551 |
| 9/24/12 | 6.444 | 6.285 | 5.629 | 6.163 | 6.537 |
| 9/25/12 | 6.441 | 6.286 | 5.626 | 6.155 | 6.543 |
| 9/26/12 | 6.44 | 6.281 | 5.624 | 6.148 | 6.539 |
| 9/27/12 | 6.435 | 6.281 | 5.599 | 6.14 | 6.557 |
| 9/28/12 | 6.448 | 6.284 | 5.586 | 6.144 | 6.56 |
| 10/1/12 | 6.46 | 6.283 | 5.64 | 6.139 | 6.558 |
| 10/2/12 | 6.465 | 6.277 | 5.641 | 6.14 | 6.553 |
| 10/3/12 | 6.471 | 6.27 | 5.643 | 6.151 | 6.522 |
| 10/4/12 | 6.48 | 6.274 | 5.628 | 6.161 | 6.562 |
| 10/5/12 | 6.477 | 6.27 | 5.632 | 6.178 | 6.557 |
| 10/8/12 | 6.475 | 6.263 | 5.62 | 6.195 | 6.555 |
| 10/9/12 | 6.481 | 6.257 | 5.612 | 6.192 | 6.579 |
| 10/10/12 | 6.488 | 6.254 | 5.612 | 6.196 | 6.577 |
| 10/11/12 | 6.493 | 6.255 | 5.605 | 6.213 | 6.589 |
| 10/15/12 | 6.508 | 6.254 | 5.631 | 6.228 | 6.59 |
| 10/16/12 | 6.498 | 6.252 | 5.609 | 6.234 | 6.584 |
| 10/17/12 | 6.498 | 6.254 | 5.611 | 6.245 | 6.567 |
| 10/18/12 | 6.499 | 6.251 | 5.622 | 6.245 | 6.56 |
| 10/19/12 | 6.504 | 6.248 | 5.641 | 6.247 | 6.54 |
| 10/22/12 | 6.506 | 6.257 | 5.643 | 6.248 | 6.534 |
| 10/23/12 | 6.502 | 6.255 | 5.641 | 6.237 | 6.523 |
| 10/24/12 | 6.498 | 6.257 | 5.635 | 6.247 | 6.519 |
| 10/25/12 | 6.494 | 6.256 | 5.633 | 6.245 | 6.525 |
| 10/26/12 | 6.492 | 6.262 | 5.616 | 6.231 | 6.535 |
| 10/29/12 | 6.495 | 6.257 | 5.611 | 6.219 | 6.534 |
| 10/30/12 | 6.496 | 6.259 | 5.609 | 6.223 | 6.53 |
| 10/31/12 | 6.5 | 6.258 | 5.616 | 6.222 | 6.527 |
| 11/1/12 | 6.503 | 6.273 | 5.635 | 6.215 | 6.522 |
| 11/5/12 | 6.504 | 6.283 | 5.614 | 6.203 | 6.518 |
| 11/6/12 | 6.499 | 6.293 | 5.608 | 6.206 | 6.548 |
| 11/7/12 | 6.497 | 6.301 | 5.611 | 6.205 | 6.509 |
| 11/8/12 | 6.494 | 6.31 | 5.603 | 6.188 | 6.513 |
| 11/9/12 | 6.491 | 6.334 | 5.599 | 6.184 | 6.533 |
| 11/12/12 | 6.49 | 6.338 | 5.6 | 6.184 | 6.53 |
| 11/13/12 | 6.483 | 6.331 | 5.571 | 6.176 | 6.523 |
| 11/14/12 | 6.482 | 6.336 | 5.579 | 6.187 | 6.535 |
| 11/16/12 | 6.482 | 6.33 | 5.575 | 6.187 | 6.529 |
| 11/19/12 | 6.491 | 6.331 | 5.584 | 6.191 | 6.554 |
| 11/20/12 | 6.495 | 6.327 | 5.6 | 6.19 | 6.537 |
| 11/21/12 | 6.499 | 6.323 | 5.605 | 6.182 | 6.546 |
| 11/22/12 | 6.5 | 6.319 | 5.603 | 6.176 | 6.544 |
| 11/23/12 | 6.499 | 6.327 | 5.606 | 6.183 | 6.551 |
| 11/26/12 | 6.502 | 6.34 | 5.609 | 6.182 | 6.547 |
| 11/27/12 | 6.503 | 6.342 | 5.62 | 6.175 | 6.537 |
| 11/28/12 | 6.504 | 6.342 | 5.637 | 6.168 | 6.534 |
| 11/29/12 | 6.508 | 6.344 | 5.637 | 6.156 | 6.546 |
| 11/30/12 | 6.508 | 6.33 | 5.627 | 6.142 | 6.55 |
| 12/3/12 | 6.508 | 6.333 | 5.622 | 6.147 | 6.547 |
| 12/4/12 | 6.509 | 6.333 | 5.631 | 6.147 | 6.537 |
| 12/5/12 | 6.509 | 6.343 | 5.627 | 6.154 | 6.528 |
| 12/6/12 | 6.508 | 6.351 | 5.635 | 6.158 | 6.511 |
| 12/7/12 | 6.502 | 6.348 | 5.627 | 6.147 | 6.511 |
| 12/10/12 | 6.492 | 6.352 | 5.607 | 6.153 | 6.514 |
| 12/11/12 | 6.488 | 6.344 | 5.597 | 6.149 | 6.52 |
| 12/12/12 | 6.484 | 6.341 | 5.595 | 6.157 | 6.534 |
| 12/13/12 | 6.476 | 6.341 | 5.592 | 6.151 | 6.519 |
| 12/14/12 | 6.469 | 6.337 | 5.584 | 6.137 | 6.531 |
| 12/17/12 | 6.467 | 6.335 | 5.599 | 6.139 | 6.517 |
| 12/18/12 | 6.457 | 6.338 | 5.589 | 6.149 | 6.528 |
| 12/19/12 | 6.449 | 6.348 | 5.584 | 6.158 | 6.542 |
| 12/20/12 | 6.449 | 6.351 | 5.56 | 6.173 | 6.54 |
| 12/21/12 | 6.442 | 6.346 | 5.369 | 6.161 | 6.529 |
| 12/26/12 | 6.442 | 6.355 | 5.56 | 6.18 | 6.548 |
| 12/27/12 | 6.438 | 6.364 | 5.561 | 6.182 | 6.546 |
| 12/28/12 | 6.437 | 6.364 | 5.544 | 6.198 | 6.544 |
| 1/2/13 | 6.437 | 6.37 | 5.553 | 6.18 | 6.561 |
| 1/3/13 | 6.423 | 6.377 | 5.551 | 6.181 | 6.558 |
| 1/4/13 | 6.42 | 6.374 | 5.55 | 6.182 | 6.55 |
| 1/7/13 | 6.42 | 6.377 | 5.537 | 6.189 | 6.551 |
| 1/8/13 | 6.422 | 6.375 | 5.546 | 6.179 | 6.556 |
| 1/9/13 | 6.422 | 6.374 | 5.55 | 6.179 | 6.554 |
| 1/10/13 | 6.427 | 6.379 | 5.557 | 6.196 | 6.556 |
| 1/11/13 | 6.44 | 6.373 | 5.564 | 6.186 | 6.544 |
| 1/14/13 | 6.446 | 6.375 | 5.578 | 6.182 | 6.556 |
| 1/15/13 | 6.444 | 6.373 | 5.6 | 6.18 | 6.541 |
| 1/16/13 | 6.451 | 6.37 | 5.609 | 6.17 | 6.544 |
| 1/17/13 | 6.454 | 6.372 | 5.609 | 6.168 | 6.549 |
| 1/18/13 | 6.46 | 6.372 | 5.601 | 6.164 | 6.556 |
| 1/21/13 | 6.467 | 6.377 | 5.605 | 6.166 | 6.554 |
| 1/22/13 | 6.475 | 6.378 | 5.606 | 6.16 | 6.56 |
| 1/23/13 | 6.473 | 6.379 | 5.607 | 6.162 | 6.564 |
| 1/24/13 | 6.468 | 6.384 | 5.596 | 6.165 | 6.568 |
| 1/25/13 | 6.468 | 6.384 | 5.6 | 6.163 | 6.568 |
| 1/28/13 | 6.477 | 6.397 | 5.596 | 6.173 | 6.57 |
| 1/29/13 | 6.482 | 6.404 | 5.607 | 6.178 | 6.577 |
| 1/30/13 | 6.486 | 6.414 | 5.608 | 6.179 | 6.582 |
| 1/31/13 | 6.494 | 6.43 | 5.626 | 6.183 | 6.588 |
| 2/1/13 | 6.502 | 6.433 | 5.627 | 6.189 | 6.598 |
| 2/4/13 | 6.508 | 6.43 | 5.624 | 6.187 | 6.588 |
| 2/5/13 | 6.508 | 6.445 | 5.622 | 6.179 | 6.596 |
| 2/6/13 | 6.508 | 6.448 | 5.615 | 6.176 | 6.598 |
| 2/7/13 | 6.504 | 6.465 | 5.607 | 6.185 | 6.602 |
| 2/8/13 | 6.504 | 6.47 | 5.59 | 6.18 | 6.616 |
| 2/13/13 | 6.496 | 6.474 | 5.57 | 6.189 | 6.615 |
| 2/14/13 | 6.492 | 6.485 | 5.57 | 6.197 | 6.609 |
| 2/15/13 | 6.486 | 6.49 | 5.568 | 6.188 | 6.606 |
| 2/18/13 | 6.488 | 6.5 | 5.574 | 6.203 | 6.604 |
| 2/19/13 | 6.491 | 6.508 | 5.571 | 6.197 | 6.605 |
| 2/20/13 | 6.498 | 6.505 | 5.568 | 6.195 | 6.588 |
| 2/21/13 | 6.5 | 6.502 | 5.577 | 6.185 | 6.57 |
| 2/22/13 | 6.507 | 6.504 | 5.563 | 6.189 | 6.575 |
| 2/25/13 | 6.506 | 6.499 | 5.561 | 6.18 | 6.578 |
| 2/26/13 | 6.503 | 6.496 | 5.565 | 6.17 | 6.563 |
| 2/27/13 | 6.499 | 6.502 | 5.578 | 6.181 | 6.555 |
| 2/28/13 | 6.494 | 6.499 | 5.578 | 6.181 | 6.551 |
| 3/1/13 | 6.504 | 6.496 | 5.59 | 6.178 | 6.542 |
| 3/4/13 | 6.508 | 6.496 | 5.597 | 6.184 | 6.539 |
| 3/5/13 | 6.509 | 6.503 | 5.589 | 6.189 | 6.553 |
| 3/6/13 | 6.512 | 6.501 | 5.597 | 6.184 | 6.548 |
| 3/7/13 | 6.511 | 6.501 | 5.57 | 6.181 | 6.549 |
| 3/8/13 | 6.524 | 6.506 | 5.572 | 6.185 | 6.546 |
| 3/11/13 | 6.543 | 6.502 | 5.59 | 6.189 | 6.541 |
| 3/12/13 | 6.551 | 6.496 | 5.6 | 6.181 | 6.535 |
| 3/13/13 | 6.559 | 6.486 | 5.604 | 6.133 | 6.525 |
| 3/14/13 | 6.561 | 6.475 | 5.599 | 6.107 | 6.533 |
| 3/15/13 | 6.586 | 6.469 | 5.608 | 6.085 | 6.537 |
| 3/18/13 | 6.589 | 6.46 | 5.608 | 6.075 | 6.534 |
| 3/19/13 | 6.592 | 6.453 | 5.612 | 6.069 | 6.515 |
| 3/20/13 | 6.591 | 6.443 | 5.624 | 6.065 | 6.527 |
| 3/21/13 | 6.575 | 6.437 | 5.629 | 6.053 | 6.515 |
| 3/22/13 | 6.569 | 6.43 | 5.627 | 6.048 | 6.517 |
| 3/25/13 | 6.562 | 6.432 | 5.615 | 6.052 | 6.522 |
| 3/26/13 | 6.567 | 6.432 | 5.624 | 6.05 | 6.533 |
| 3/27/13 | 6.567 | 6.443 | 5.619 | 6.064 | 6.536 |
| 3/28/13 | 6.535 | 6.435 | 5.626 | 6.056 | 6.539 |
| 4/1/13 | 6.516 | 6.432 | 5.571 | 6.056 | 6.548 |
| 4/2/13 | 6.538 | 6.43 | 5.494 | 6.051 | 6.545 |
| 4/3/13 | 6.524 | 6.437 | 5.493 | 6.051 | 6.512 |
| 4/4/13 | 6.521 | 6.479 | 5.494 | 6.048 | 6.505 |
| 4/5/13 | 6.531 | 6.494 | 5.476 | 6.059 | 6.484 |
| 4/8/13 | 6.537 | 6.501 | 5.473 | 6.062 | 6.489 |
| 4/9/13 | 6.547 | 6.507 | 5.48 | 6.061 | 6.504 |
| 4/10/13 | 6.548 | 6.52 | 5.496 | 6.074 | 6.5 |
| 4/11/13 | 6.544 | 6.524 | 5.502 | 6.077 | 6.485 |
| 4/12/13 | 6.537 | 6.532 | 5.499 | 6.092 | 6.474 |
| 4/15/13 | 6.524 | 6.529 | 5.511 | 6.092 | 6.447 |
| 4/16/13 | 6.523 | 6.526 | 5.493 | 6.108 | 6.442 |
| 4/17/13 | 6.528 | 6.52 | 5.516 | 6.112 | 6.42 |
| 4/18/13 | 6.533 | 6.494 | 5.514 | 6.107 | 6.435 |
| 4/19/13 | 6.545 | 6.481 | 5.485 | 6.11 | 6.44 |
| 4/22/13 | 6.547 | 6.462 | 5.49 | 6.113 | 6.447 |
| 4/23/13 | 6.544 | 6.431 | 5.476 | 6.114 | 6.446 |
| 4/24/13 | 6.541 | 6.419 | 5.46 | 6.119 | 6.46 |
| 4/25/13 | 6.542 | 6.405 | 5.466 | 6.117 | 6.477 |
| 4/26/13 | 6.545 | 6.396 | 5.477 | 6.121 | 6.474 |
| 4/29/13 | 6.554 | 6.385 | 5.47 | 6.113 | 6.481 |
| 4/30/13 | 6.563 | 6.383 | 5.53 | 6.118 | 6.467 |
| 5/2/13 | 6.574 | 6.367 | 5.512 | 6.105 | 6.471 |
| 5/3/13 | 6.592 | 6.357 | 5.534 | 6.106 | 6.484 |
| 5/6/13 | 6.602 | 6.343 | 5.534 | 6.113 | 6.496 |
| 5/7/13 | 6.602 | 6.34 | 5.499 | 6.115 | 6.486 |
| 5/8/13 | 6.62 | 6.34 | 5.508 | 6.116 | 6.486 |
| 5/9/13 | 6.618 | 6.333 | 5.497 | 6.103 | 6.487 |
| 5/10/13 | 6.615 | 6.317 | 5.521 | 6.096 | 6.482 |
| 5/13/13 | 6.617 | 6.311 | 5.502 | 6.105 | 6.471 |
| 5/14/13 | 6.614 | 6.299 | 5.531 | 6.094 | 6.469 |
| 5/15/13 | 6.604 | 6.273 | 5.527 | 6.088 | 6.479 |
| 5/16/13 | 6.595 | 6.246 | 5.524 | 6.082 | 6.481 |
| 5/17/13 | 6.593 | 6.229 | 5.515 | 6.071 | 6.489 |
| 5/20/13 | 6.587 | 6.225 | 5.531 | 6.066 | 6.49 |
| 5/21/13 | 6.585 | 6.219 | 5.527 | 6.062 | 6.482 |
| 5/22/13 | 6.593 | 6.212 | 5.512 | 6.056 | 6.469 |
| 5/23/13 | 6.588 | 6.206 | 5.54 | 6.057 | 6.467 |
| 5/24/13 | 6.595 | 6.208 | 5.544 | 6.058 | 6.469 |
| 5/27/13 | 6.595 | 6.21 | 5.537 | 6.061 | 6.469 |
| 5/28/13 | 6.595 | 6.205 | 5.544 | 6.055 | 6.485 |
| 5/29/13 | 6.604 | 6.186 | 5.551 | 6.04 | 6.467 |
| 5/31/13 | 6.617 | 6.176 | 5.533 | 6.027 | 6.447 |
| 6/3/13 | 6.62 | 6.182 | 5.544 | 6.044 | 6.464 |
| 6/4/13 | 6.62 | 6.191 | 5.535 | 6.03 | 6.475 |
| 6/5/13 | 6.62 | 6.199 | 5.543 | 6.025 | 6.473 |
| 6/6/13 | 6.62 | 6.212 | 5.543 | 6.033 | 6.479 |
| 6/7/13 | 6.617 | 6.204 | 5.546 | 6.026 | 6.488 |
| 6/10/13 | 6.613 | 6.196 | 5.55 | 6.018 | 6.482 |
| 6/11/13 | 6.608 | 6.208 | 5.527 | 6.017 | 6.472 |
| 6/12/13 | 6.603 | 6.214 | 5.541 | 6.011 | 6.478 |
| 6/13/13 | 6.596 | 6.222 | 5.528 | 6.011 | 6.485 |
| 6/14/13 | 6.595 | 6.222 | 5.518 | 6.004 | 6.501 |
| 6/17/13 | 6.594 | 6.21 | 5.534 | 5.994 | 6.497 |
| 6/18/13 | 6.598 | 6.207 | 5.554 | 5.996 | 6.502 |
| 6/19/13 | 6.595 | 6.193 | 5.563 | 5.987 | 6.503 |
| 6/20/13 | 6.576 | 6.173 | 5.579 | 5.968 | 6.465 |
| 6/21/13 | 6.575 | 6.179 | 5.567 | 5.981 | 6.452 |
| 6/24/13 | 6.564 | 6.19 | 5.551 | 5.992 | 6.455 |
| 6/25/13 | 6.561 | 6.202 | 5.538 | 6.002 | 6.456 |
| 6/26/13 | 6.547 | 6.212 | 5.544 | 6.014 | 6.46 |
| 6/27/13 | 6.545 | 6.214 | 5.556 | 6.019 | 6.471 |
| 6/28/13 | 6.545 | 6.195 | 5.553 | 6.001 | 6.465 |
| 7/1/13 | 6.545 | 6.196 | 5.546 | 6.001 | 6.473 |
| 7/2/13 | 6.549 | 6.182 | 5.494 | 5.996 | 6.483 |
| 7/3/13 | 6.543 | 6.175 | 5.543 | 5.989 | 6.499 |
| 7/4/13 | 6.542 | 6.176 | 5.537 | 5.993 | 6.497 |
| 7/5/13 | 6.541 | 6.164 | 5.527 | 5.991 | 6.518 |
| 7/8/13 | 6.537 | 6.16 | 5.518 | 5.993 | 6.515 |
| 7/10/13 | 6.54 | 6.153 | 5.553 | 5.989 | 6.525 |
| 7/11/13 | 6.544 | 6.156 | 5.556 | 5.985 | 6.518 |
| 7/12/13 | 6.544 | 6.148 | 5.565 | 5.981 | 6.528 |
| 7/15/13 | 6.552 | 6.153 | 5.522 | 5.989 | 6.53 |
| 7/16/13 | 6.55 | 6.138 | 5.508 | 5.973 | 6.533 |
| 7/17/13 | 6.555 | 6.138 | 5.521 | 5.979 | 6.526 |
| 7/18/13 | 6.565 | 6.129 | 5.512 | 5.977 | 6.527 |
| 7/19/13 | 6.556 | 6.12 | 5.522 | 5.973 | 6.521 |
| 7/22/13 | 6.56 | 6.117 | 5.527 | 5.975 | 6.522 |
| 7/23/13 | 6.553 | 6.123 | 5.522 | 5.982 | 6.524 |
| 7/24/13 | 6.543 | 6.11 | 5.496 | 5.965 | 6.513 |
| 7/25/13 | 6.534 | 6.113 | 5.473 | 5.974 | 6.517 |
| 7/26/13 | 6.525 | 6.115 | 5.406 | 5.966 | 6.513 |
| 7/29/13 | 6.521 | 6.107 | 5.399 | 5.958 | 6.515 |
| 7/30/13 | 6.506 | 6.104 | 5.394 | 5.946 | 6.51 |
| 7/31/13 | 6.487 | 6.106 | 5.406 | 5.957 | 6.517 |
| 8/1/13 | 6.484 | 6.094 | 5.411 | 5.951 | 6.534 |
| 8/2/13 | 6.476 | 6.105 | 5.401 | 5.963 | 6.529 |
| 8/5/13 | 6.464 | 6.096 | 5.381 | 5.957 | 6.527 |
| 8/6/13 | 6.455 | 6.096 | 5.369 | 5.949 | 6.522 |
| 8/7/13 | 6.448 | 6.089 | 5.374 | 5.94 | 6.515 |
| 8/8/13 | 6.447 | 6.097 | 5.367 | 5.937 | 6.508 |
| 8/9/13 | 6.446 | 6.103 | 5.377 | 5.932 | 6.522 |
| 8/12/13 | 6.451 | 6.094 | 5.364 | 5.919 | 6.529 |
| 8/13/13 | 6.448 | 6.087 | 5.391 | 5.911 | 6.537 |
| 8/14/13 | 6.455 | 6.079 | 5.362 | 5.909 | 6.54 |
| 8/15/13 | 6.467 | 6.07 | 5.379 | 5.903 | 6.549 |
| 8/16/13 | 6.463 | 6.049 | 5.407 | 5.886 | 6.542 |
| 8/19/13 | 6.477 | 6.04 | 5.394 | 5.881 | 6.538 |
| 8/20/13 | 6.474 | 6.049 | 5.425 | 5.891 | 6.54 |
| 8/21/13 | 6.482 | 6.037 | 5.416 | 5.88 | 6.537 |
| 8/22/13 | 6.485 | 6.039 | 5.438 | 5.881 | 6.538 |
| 8/23/13 | 6.508 | 6.084 | 5.454 | 5.913 | 6.548 |
| 8/26/13 | 6.542 | 6.081 | 5.466 | 5.903 | 6.545 |
| 8/27/13 | 6.56 | 6.089 | 5.422 | 5.917 | 6.577 |
| 8/28/13 | 6.567 | 6.105 | 5.396 | 5.929 | 6.597 |
| 8/29/13 | 6.576 | 6.096 | 5.397 | 5.914 | 6.584 |
| 8/30/13 | 6.574 | 6.091 | 5.365 | 5.911 | 6.574 |
| 9/2/13 | 6.576 | 6.097 | 5.365 | 5.92 | 6.577 |
| 9/3/13 | 6.579 | 6.101 | 5.336 | 5.931 | 6.589 |
| 9/4/13 | 6.576 | 6.104 | 5.322 | 5.936 | 6.582 |
| 9/5/13 | 6.576 | 6.123 | 5.309 | 5.948 | 6.585 |
| 9/6/13 | 6.573 | 6.13 | 5.292 | 5.955 | 6.593 |
| 9/9/13 | 6.574 | 6.151 | 5.305 | 5.972 | 6.572 |
| 9/10/13 | 6.571 | 6.145 | 5.181 | 5.969 | 6.55 |
| 9/11/13 | 6.557 | 6.154 | 5.191 | 5.976 | 6.552 |
| 9/12/13 | 6.543 | 6.149 | 5.199 | 5.978 | 6.562 |
| 9/13/13 | 6.531 | 6.148 | 5.185 | 5.974 | 6.564 |
| 9/16/13 | 6.517 | 6.147 | 5.17 | 5.979 | 6.539 |
| 9/17/13 | 6.504 | 6.159 | 5.134 | 5.987 | 6.522 |
| 9/18/13 | 6.506 | 6.19 | 5.128 | 6.023 | 6.544 |
| 9/19/13 | 6.5 | 6.189 | 5.11 | 6.026 | 6.527 |
| 9/20/13 | 6.493 | 6.18 | 5.119 | 6.018 | 6.532 |
| 9/23/13 | 6.484 | 6.197 | 5.099 | 6.036 | 6.522 |
| 9/24/13 | 6.478 | 6.21 | 5.088 | 6.041 | 6.526 |
| 9/25/13 | 6.479 | 6.205 | 5.079 | 6.035 | 6.523 |
| 9/26/13 | 6.478 | 6.185 | 5.086 | 6.036 | 6.531 |
| 9/27/13 | 6.482 | 6.173 | 5.09 | 6.029 | 6.526 |
| 9/30/13 | 6.485 | 6.202 | 5.083 | 6.053 | 6.524 |
| 10/1/13 | 6.47 | 6.201 | 5.046 | 6.057 | 6.52 |
| 10/2/13 | 6.457 | 6.215 | 5.039 | 6.087 | 6.531 |
| 10/3/13 | 6.439 | 6.216 | 5.039 | 6.086 | 6.529 |
| 10/4/13 | 6.409 | 6.211 | 5.039 | 6.089 | 6.534 |
| 10/7/13 | 6.376 | 6.217 | 5.049 | 6.104 | 6.536 |
| 10/8/13 | 6.366 | 6.214 | 5.063 | 6.107 | 6.54 |
| 10/9/13 | 6.357 | 6.214 | 5.046 | 6.109 | 6.53 |
| 10/10/13 | 6.358 | 6.231 | 5.051 | 6.127 | 6.555 |
| 10/11/13 | 6.356 | 6.234 | 5.037 | 6.129 | 6.55 |
| 10/14/13 | 6.349 | 6.234 | 5.025 | 6.137 | 6.548 |
| 10/15/13 | 6.355 | 6.226 | 5.034 | 6.129 | 6.538 |
| 10/16/13 | 6.371 | 6.231 | 5.051 | 6.143 | 6.546 |
| 10/17/13 | 6.377 | 6.239 | 5.049 | 6.156 | 6.53 |
| 10/18/13 | 6.382 | 6.237 | 5.049 | 6.166 | 6.538 |
| 10/21/13 | 6.383 | 6.232 | 5.046 | 6.169 | 6.535 |
| 10/22/13 | 6.379 | 6.233 | 5.053 | 6.176 | 6.538 |
| 10/23/13 | 6.37 | 6.225 | 5.039 | 6.173 | 6.518 |
| 10/24/13 | 6.368 | 6.216 | 5.072 | 6.167 | 6.511 |
| 10/25/13 | 6.362 | 6.222 | 5.065 | 6.175 | 6.51 |
| 10/28/13 | 6.362 | 6.221 | 5.065 | 6.18 | 6.535 |
| 10/29/13 | 6.359 | 6.225 | 5.044 | 6.18 | 6.53 |
| 10/30/13 | 6.355 | 6.214 | 5.046 | 6.176 | 6.537 |
| 10/31/13 | 6.352 | 6.197 | 5.041 | 6.153 | 6.528 |
| 11/1/13 | 6.338 | 6.195 | 5.037 | 6.139 | 6.501 |
| 11/4/13 | 6.33 | 6.198 | 5.029 | 6.147 | 6.504 |
| 11/5/13 | 6.328 | 6.176 | 5.027 | 6.119 | 6.495 |
| 11/6/13 | 6.313 | 6.184 | 5.027 | 6.119 | 6.494 |
| 11/7/13 | 6.283 | 6.175 | 5.017 | 6.104 | 6.477 |
| 11/8/13 | 6.285 | 6.185 | 5.017 | 6.099 | 6.493 |
| 11/11/13 | 6.284 | 6.187 | 5.027 | 6.093 | 6.505 |
| 11/12/13 | 6.272 | 6.2 | 5.046 | 6.097 | 6.5 |
| 11/13/13 | 6.292 | 6.202 | 5.039 | 6.103 | 6.512 |
| 11/14/13 | 6.301 | 6.204 | 5.034 | 6.109 | 6.525 |
| 11/18/13 | 6.354 | 6.23 | 5.015 | 6.132 | 6.525 |
| 11/19/13 | 6.368 | 6.233 | 4.99 | 6.124 | 6.51 |
| 11/21/13 | 6.45 | 6.22 | 5.003 | 6.106 | 6.539 |
| 11/22/13 | 6.512 | 6.231 | 5.017 | 6.118 | 6.548 |
| 11/25/13 | 6.571 | 6.241 | 5.015 | 6.116 | 6.548 |
| 11/26/13 | 6.569 | 6.24 | 5.022 | 6.113 | 6.547 |
| 11/27/13 | 6.537 | 6.237 | 5.008 | 6.109 | 6.55 |
| 11/28/13 | 6.541 | 6.238 | 5.005 | 6.106 | 6.546 |
| 11/29/13 | 6.541 | 6.232 | 5.003 | 6.091 | 6.536 |
| 12/2/13 | 6.531 | 6.234 | 5 | 6.084 | 6.552 |
| 12/3/13 | 6.54 | 6.24 | 5.013 | 6.077 | 6.562 |
| 12/4/13 | 6.54 | 6.243 | 5.027 | 6.07 | 6.556 |
| 12/5/13 | 6.538 | 6.261 | 5.041 | 6.077 | 6.547 |
| 12/6/13 | 6.546 | 6.272 | 5.034 | 6.086 | 6.553 |
| 12/9/13 | 6.541 | 6.283 | 5.034 | 6.086 | 6.533 |
| 12/10/13 | 6.533 | 6.283 | 5.044 | 6.093 | 6.533 |
| 12/11/13 | 6.521 | 6.264 | 5.039 | 6.079 | 6.536 |
| 12/12/13 | 6.51 | 6.264 | 5.046 | 6.08 | 6.526 |
| 12/13/13 | 6.491 | 6.268 | 5.034 | 6.076 | 6.528 |
| 12/16/13 | 6.464 | 6.265 | 5.015 | 6.078 | 6.543 |
| 12/17/13 | 6.445 | 6.267 | 5.008 | 6.087 | 6.524 |
| 12/18/13 | 6.439 | 6.25 | 5.017 | 6.065 | 6.535 |
| 12/19/13 | 6.433 | 6.254 | 5.013 | 6.064 | 6.541 |
| 12/20/13 | 6.435 | 6.242 | 5.027 | 6.052 | 6.555 |
| 12/23/13 | 6.439 | 6.249 | 5.032 | 6.059 | 6.553 |
| 12/26/13 | 6.438 | 6.246 | 5.041 | 6.067 | 6.556 |
| 12/27/13 | 6.44 | 6.256 | 5.02 | 6.076 | 6.558 |
| 12/30/13 | 6.43 | 6.252 | 5.025 | 6.075 | 6.55 |
| 1/2/14 | 6.423 | 6.24 | 5.01 | 6.055 | 6.518 |
| 1/3/14 | 6.428 | 6.242 | 5.01 | 6.067 | 6.51 |
| 1/6/14 | 6.43 | 6.243 | 5.017 | 6.067 | 6.508 |
| 1/7/14 | 6.433 | 6.246 | 5.027 | 6.063 | 6.514 |
| 1/8/14 | 6.423 | 6.239 | 5.022 | 6.057 | 6.512 |
| 1/9/14 | 6.414 | 6.236 | 5 | 6.052 | 6.505 |
| 1/10/14 | 6.421 | 6.255 | 4.988 | 6.06 | 6.513 |
| 1/13/14 | 6.431 | 6.264 | 5.039 | 6.064 | 6.509 |
| 1/14/14 | 6.423 | 6.256 | 5.044 | 6.06 | 6.505 |
| 1/15/14 | 6.417 | 6.253 | 5.037 | 6.055 | 6.512 |
| 1/16/14 | 6.393 | 6.25 | 5.022 | 6.053 | 6.512 |
| 1/17/14 | 6.369 | 6.258 | 5.027 | 6.047 | 6.506 |
| 1/20/14 | 6.37 | 6.263 | 5.017 | 6.049 | 6.505 |
| 1/21/14 | 6.358 | 6.249 | 5.019 | 6.041 | 6.508 |
| 1/22/14 | 6.354 | 6.242 | 5.02 | 6.038 | 6.523 |
| 1/23/14 | 6.349 | 6.232 | 5.022 | 6.027 | 6.516 |
| 1/24/14 | 6.338 | 6.239 | 5.029 | 6.027 | 6.519 |
| 1/27/14 | 6.325 | 6.222 | 5.033 | 6.019 | 6.508 |
| 1/28/14 | 6.321 | 6.219 | 5.037 | 6.02 | 6.515 |
| 1/29/14 | 6.313 | 6.218 | 5.037 | 6.021 | 6.519 |
| 1/30/14 | 6.307 | 6.232 | 5.027 | 6.022 | 6.52 |
| 1/31/14 | 6.298 | 6.234 | 5.041 | 6.024 | 6.505 |
| 2/3/14 | 6.301 | 6.231 | 5.041 | 6.016 | 6.502 |
| 2/4/14 | 6.298 | 6.248 | 5.046 | 6.024 | 6.5 |
| 2/5/14 | 6.299 | 6.263 | 5.06 | 6.028 | 6.504 |
| 2/6/14 | 6.309 | 6.281 | 5.063 | 6.038 | 6.513 |
| 2/7/14 | 6.315 | 6.298 | 5.063 | 6.043 | 6.535 |
| 2/10/14 | 6.324 | 6.29 | 5.065 | 6.033 | 6.526 |
| 2/11/14 | 6.317 | 6.301 | 5.063 | 6.027 | 6.527 |
| 2/12/14 | 6.304 | 6.295 | 5.06 | 6.024 | 6.528 |
| 2/13/14 | 6.295 | 6.306 | 5.056 | 6.032 | 6.527 |
| 2/14/14 | 6.292 | 6.323 | 5.058 | 6.03 | 6.53 |
| 2/17/14 | 6.294 | 6.326 | 5.067 | 6.036 | 6.531 |
| 2/18/14 | 6.301 | 6.339 | 5.071 | 6.04 | 6.543 |
| 2/19/14 | 6.308 | 6.341 | 5.079 | 6.047 | 6.543 |
| 2/20/14 | 6.313 | 6.35 | 5.088 | 6.051 | 6.541 |
| 2/21/14 | 6.313 | 6.362 | 5.092 | 6.06 | 6.537 |
| 2/24/14 | 6.331 | 6.371 | 5.081 | 6.074 | 6.544 |
| 2/25/14 | 6.343 | 6.377 | 5.079 | 6.083 | 6.534 |
| 2/26/14 | 6.367 | 6.369 | 5.088 | 6.08 | 6.534 |
| 2/27/14 | 6.373 | 6.384 | 5.09 | 6.097 | 6.529 |
| 2/28/14 | 6.387 | 6.376 | 5.076 | 6.086 | 6.53 |
| 3/5/14 | 6.436 | 6.391 | 5.139 | 6.102 | 6.518 |
| 3/6/14 | 6.449 | 6.389 | 5.134 | 6.102 | 6.521 |
| 3/7/14 | 6.477 | 6.379 | 5.143 | 6.089 | 6.529 |
| 3/10/14 | 6.467 | 6.365 | 5.139 | 6.091 | 6.521 |
| 3/11/14 | 6.466 | 6.365 | 5.115 | 6.084 | 6.525 |
| 3/12/14 | 6.449 | 6.365 | 5.126 | 6.083 | 6.52 |
| 3/13/14 | 6.483 | 6.363 | 5.139 | 6.085 | 6.515 |
| 3/14/14 | 6.507 | 6.365 | 5.13 | 6.088 | 6.526 |
| 3/17/14 | 6.517 | 6.364 | 5.132 | 6.086 | 6.504 |
| 3/18/14 | 6.546 | 6.365 | 5.117 | 6.094 | 6.509 |
| 3/19/14 | 6.593 | 6.354 | 5.132 | 6.09 | 6.5 |
| 3/20/14 | 6.679 | 6.368 | 5.137 | 6.1 | 6.506 |
| 3/21/14 | 6.724 | 6.367 | 5.123 | 6.102 | 6.51 |
| 3/24/14 | 6.758 | 6.361 | 5.123 | 6.106 | 6.509 |
| 3/25/14 | 6.759 | 6.363 | 5.147 | 6.111 | 6.511 |
| 3/26/14 | 6.778 | 6.355 | 5.149 | 6.101 | 6.511 |
| 3/27/14 | 6.77 | 6.373 | 5.145 | 6.125 | 6.519 |
| 3/28/14 | 6.802 | 6.356 | 5.162 | 6.13 | 6.521 |
| 3/31/14 | 6.84 | 6.347 | 5.162 | 6.126 | 6.518 |
| 4/1/14 | 6.858 | 6.332 | 5.183 | 6.124 | 6.498 |
| 4/2/14 | 6.84 | 6.303 | 5.195 | 6.122 | 6.49 |
| 4/3/14 | 6.798 | 6.293 | 5.17 | 6.123 | 6.503 |
| 4/4/14 | 6.766 | 6.296 | 5.179 | 6.14 | 6.508 |
| 4/7/14 | 6.764 | 6.312 | 5.181 | 6.149 | 6.5 |
| 4/8/14 | 6.747 | 6.318 | 5.175 | 6.15 | 6.517 |
| 4/9/14 | 6.735 | 6.335 | 5.191 | 6.152 | 6.52 |
| 4/10/14 | 6.739 | 6.361 | 5.181 | 6.147 | 6.515 |
| 4/11/14 | 6.734 | 6.38 | 5.179 | 6.136 | 6.514 |
| 4/14/14 | 6.724 | 6.41 | 5.175 | 6.141 | 6.53 |
| 4/15/14 | 6.7 | 6.421 | 5.183 | 6.129 | 6.527 |
| 4/16/14 | 6.677 | 6.419 | 5.185 | 6.134 | 6.535 |
| 4/17/14 | 6.658 | 6.391 | 5.173 | 6.136 | 6.534 |
| 4/22/14 | 6.624 | 6.392 | 5.156 | 6.131 | 6.532 |
| 4/23/14 | 6.615 | 6.383 | 5.175 | 6.144 | 6.53 |
| 4/24/14 | 6.591 | 6.364 | 5.191 | 6.142 | 6.542 |
| 4/25/14 | 6.566 | 6.323 | 5.185 | 6.14 | 6.535 |
| 4/28/14 | 6.563 | 6.317 | 5.197 | 6.144 | 6.521 |
| 4/29/14 | 6.554 | 6.293 | 5.203 | 6.139 | 6.529 |
| 4/30/14 | 6.539 | 6.266 | 5.221 | 6.136 | 6.521 |
| 5/2/14 | 6.521 | 6.254 | 5.191 | 6.14 | 6.526 |
| 5/5/14 | 6.483 | 6.243 | 5.177 | 6.134 | 6.518 |
| 5/6/14 | 6.452 | 6.222 | 5.193 | 6.145 | 6.512 |
| 5/7/14 | 6.444 | 6.213 | 5.213 | 6.148 | 6.521 |
| 5/8/14 | 6.454 | 6.215 | 5.205 | 6.149 | 6.521 |
| 5/9/14 | 6.494 | 6.217 | 5.211 | 6.146 | 6.519 |
| 5/12/14 | 6.483 | 6.215 | 5.193 | 6.145 | 6.524 |
| 5/13/14 | 6.466 | 6.22 | 5.177 | 6.142 | 6.532 |
| 5/14/14 | 6.472 | 6.235 | 5.187 | 6.141 | 6.54 |
| 5/15/14 | 6.474 | 6.239 | 5.173 | 6.14 | 6.543 |
| 5/16/14 | 6.506 | 6.257 | 5.147 | 6.145 | 6.536 |
| 5/19/14 | 6.503 | 6.257 | 5.147 | 6.139 | 6.533 |
| 5/20/14 | 6.483 | 6.25 | 5.132 | 6.138 | 6.536 |
| 5/21/14 | 6.483 | 6.245 | 5.126 | 6.139 | 6.544 |
| 5/22/14 | 6.491 | 6.229 | 5.137 | 6.139 | 6.542 |
| 5/23/14 | 6.504 | 6.225 | 5.141 | 6.137 | 6.544 |
| 5/26/14 | 6.511 | 6.233 | 5.143 | 6.142 | 6.542 |
| 5/27/14 | 6.51 | 6.221 | 5.134 | 6.131 | 6.539 |
| 5/28/14 | 6.508 | 6.223 | 5.126 | 6.134 | 6.537 |
| 5/29/14 | 6.501 | 6.231 | 5.132 | 6.122 | 6.538 |
| 5/30/14 | 6.502 | 6.223 | 5.13 | 6.121 | 6.533 |
| 6/2/14 | 6.492 | 6.215 | 5.121 | 6.11 | 6.528 |
| 6/3/14 | 6.487 | 6.208 | 5.121 | 6.1 | 6.528 |
| 6/4/14 | 6.477 | 6.215 | 5.104 | 6.088 | 6.524 |
| 6/5/14 | 6.462 | 6.231 | 5.099 | 6.093 | 6.528 |
| 6/6/14 | 6.457 | 6.238 | 5.083 | 6.101 | 6.526 |
| 6/9/14 | 6.47 | 6.247 | 5.106 | 6.104 | 6.539 |
| 6/10/14 | 6.469 | 6.246 | 5.088 | 6.104 | 6.534 |
| 6/11/14 | 6.451 | 6.242 | 5.076 | 6.099 | 6.538 |
| 6/13/14 | 6.446 | 6.242 | 5.072 | 6.098 | 6.569 |
| 6/16/14 | 6.439 | 6.244 | 5.079 | 6.085 | 6.565 |
| 6/17/14 | 6.439 | 6.234 | 5.065 | 6.08 | 6.57 |
| 6/18/14 | 6.413 | 6.246 | 5.06 | 6.086 | 6.577 |
| 6/20/14 | 6.379 | 6.251 | 5.088 | 6.09 | 6.581 |
| 6/23/14 | 6.379 | 6.251 | 5.092 | 6.087 | 6.575 |
| 6/24/14 | 6.382 | 6.247 | 5.074 | 6.085 | 6.578 |
| 6/25/14 | 6.372 | 6.257 | 5.06 | 6.085 | 6.574 |
| 6/26/14 | 6.379 | 6.27 | 5.058 | 6.095 | 6.567 |
| 6/27/14 | 6.384 | 6.269 | 5.065 | 6.1 | 6.568 |
| 6/30/14 | 6.383 | 6.267 | 5.072 | 6.092 | 6.56 |
| 7/1/14 | 6.4 | 6.268 | 5.017 | 6.085 | 6.559 |
| 7/2/14 | 6.411 | 6.26 | 5.01 | 6.079 | 6.55 |
| 7/3/14 | 6.419 | 6.273 | 5 | 6.085 | 6.548 |
| 7/4/14 | 6.424 | 6.264 | 4.995 | 6.077 | 6.544 |
| 7/7/14 | 6.421 | 6.258 | 4.988 | 6.067 | 6.541 |
| 7/8/14 | 6.43 | 6.269 | 4.973 | 6.067 | 6.529 |
| 7/10/14 | 6.422 | 6.271 | 4.947 | 6.068 | 6.526 |
| 7/11/14 | 6.413 | 6.269 | 4.934 | 6.063 | 6.508 |
| 7/14/14 | 6.412 | 6.267 | 4.912 | 6.056 | 6.511 |
| 7/15/14 | 6.389 | 6.265 | 4.923 | 6.043 | 6.502 |
| 7/16/14 | 6.387 | 6.269 | 4.923 | 6.035 | 6.5 |
| 7/17/14 | 6.371 | 6.254 | 4.934 | 6.027 | 6.519 |
| 7/18/14 | 6.364 | 6.261 | 4.939 | 6.037 | 6.513 |
| 7/21/14 | 6.357 | 6.256 | 4.915 | 6.039 | 6.517 |
| 7/22/14 | 6.345 | 6.248 | 4.901 | 6.038 | 6.514 |
| 7/23/14 | 6.346 | 6.236 | 4.89 | 6.039 | 6.521 |
| 7/24/14 | 6.345 | 6.246 | 4.899 | 6.037 | 6.512 |
| 7/25/14 | 6.339 | 6.237 | 4.896 | 6.027 | 6.524 |
| 7/28/14 | 6.354 | 6.238 | 4.899 | 6.032 | 6.516 |
| 7/29/14 | 6.364 | 6.236 | 4.912 | 6.024 | 6.518 |
| 7/30/14 | 6.363 | 6.227 | 4.896 | 6.013 | 6.506 |
| 7/31/14 | 6.361 | 6.218 | 4.896 | 6.006 | 6.502 |
| 8/1/14 | 6.356 | 6.222 | 4.882 | 6.009 | 6.491 |
| 8/4/14 | 6.358 | 6.221 | 4.871 | 6.005 | 6.496 |
| 8/5/14 | 6.361 | 6.204 | 4.888 | 5.993 | 6.488 |
| 8/6/14 | 6.347 | 6.214 | 4.879 | 6.003 | 6.488 |
| 8/7/14 | 6.366 | 6.205 | 4.899 | 5.983 | 6.496 |
| 8/8/14 | 6.386 | 6.216 | 4.89 | 5.985 | 6.492 |
| 8/11/14 | 6.391 | 6.209 | 4.868 | 5.992 | 6.489 |
| 8/12/14 | 6.396 | 6.208 | 4.882 | 5.994 | 6.473 |
| 8/13/14 | 6.413 | 6.212 | 4.888 | 5.986 | 6.485 |
| 8/14/14 | 6.423 | 6.21 | 4.885 | 5.992 | 6.463 |
| 8/15/14 | 6.417 | 6.219 | 4.896 | 5.999 | 6.478 |
| 8/18/14 | 6.418 | 6.218 | 4.907 | 5.999 | 6.459 |
| 8/19/14 | 6.405 | 6.228 | 4.893 | 5.997 | 6.459 |
| 8/20/14 | 6.402 | 6.224 | 4.926 | 5.998 | 6.466 |
| 8/21/14 | 6.399 | 6.226 | 4.918 | 5.997 | 6.469 |
| 8/22/14 | 6.402 | 6.221 | 4.923 | 5.986 | 6.466 |
| 8/25/14 | 6.414 | 6.228 | 4.934 | 5.987 | 6.469 |
| 8/26/14 | 6.403 | 6.243 | 4.918 | 5.995 | 6.468 |
| 8/27/14 | 6.402 | 6.253 | 4.907 | 5.998 | 6.47 |
| 8/28/14 | 6.399 | 6.264 | 4.907 | 6.003 | 6.468 |
| 8/29/14 | 6.398 | 6.254 | 4.931 | 5.997 | 6.475 |
| 9/1/14 | 6.399 | 6.254 | 4.926 | 5.997 | 6.471 |
| 9/2/14 | 6.388 | 6.251 | 4.924 | 5.999 | 6.447 |
| 9/3/14 | 6.387 | 6.251 | 4.923 | 6.01 | 6.471 |
| 9/4/14 | 6.382 | 6.245 | 4.848 | 5.997 | 6.461 |
| 9/5/14 | 6.378 | 6.246 | 4.834 | 5.995 | 6.451 |
| 9/8/14 | 6.38 | 6.236 | 4.845 | 5.984 | 6.445 |
| 9/9/14 | 6.369 | 6.222 | 4.822 | 5.968 | 6.435 |
| 9/10/14 | 6.352 | 6.225 | 4.795 | 5.968 | 6.424 |
| 9/11/14 | 6.33 | 6.221 | 4.801 | 5.969 | 6.424 |
| 9/12/14 | 6.315 | 6.2 | 4.786 | 5.94 | 6.414 |
| 9/15/14 | 6.301 | 6.193 | 4.78 | 5.94 | 6.409 |
| 9/16/14 | 6.302 | 6.194 | 4.776 | 5.941 | 6.434 |
| 9/17/14 | 6.286 | 6.18 | 4.78 | 5.934 | 6.433 |
| 9/18/14 | 6.262 | 6.174 | 4.773 | 5.925 | 6.42 |
| 9/19/14 | 6.251 | 6.16 | 4.751 | 5.923 | 6.427 |
| 9/22/14 | 6.223 | 6.15 | 4.722 | 5.912 | 6.413 |
| 9/23/14 | 6.215 | 6.139 | 4.716 | 5.906 | 6.411 |
| 9/24/14 | 6.193 | 6.147 | 4.689 | 5.914 | 6.412 |
| 9/25/14 | 6.19 | 6.122 | 4.703 | 5.903 | 6.413 |
| 9/26/14 | 6.17 | 6.122 | 4.689 | 5.917 | 6.413 |
| 9/29/14 | 6.158 | 6.097 | 4.689 | 5.916 | 6.415 |
| 9/30/14 | 6.151 | 6.101 | 4.689 | 5.919 | 6.389 |
| 10/1/14 | 6.151 | 6.087 | 4.665 | 5.903 | 6.383 |
| 10/2/14 | 6.145 | 6.081 | 4.651 | 5.911 | 6.375 |
| 10/3/14 | 6.1 | 6.081 | 4.658 | 5.921 | 6.363 |
| 10/6/14 | 6.104 | 6.095 | 4.658 | 5.946 | 6.368 |
| 10/7/14 | 6.104 | 6.103 | 4.693 | 5.958 | 6.361 |
| 10/8/14 | 6.113 | 6.114 | 4.719 | 5.971 | 6.353 |
| 10/9/14 | 6.136 | 6.111 | 4.726 | 5.97 | 6.339 |
| 10/10/14 | 6.132 | 6.09 | 4.732 | 5.958 | 6.34 |
| 10/13/14 | 6.155 | 6.11 | 4.696 | 5.975 | 6.326 |
| 10/14/14 | 6.16 | 6.103 | 4.735 | 5.974 | 6.281 |
| 10/15/14 | 6.163 | 6.094 | 4.77 | 5.963 | 6.266 |
| 10/16/14 | 6.189 | 6.082 | 4.742 | 5.956 | 6.275 |
| 10/17/14 | 6.218 | 6.095 | 4.755 | 5.972 | 6.294 |
| 10/20/14 | 6.221 | 6.082 | 4.742 | 5.967 | 6.285 |
| 10/21/14 | 6.227 | 6.073 | 4.742 | 5.971 | 6.295 |
| 10/22/14 | 6.232 | 6.066 | 4.767 | 5.967 | 6.277 |
| 10/23/14 | 6.223 | 6.051 | 4.758 | 5.962 | 6.302 |
| 10/24/14 | 6.218 | 6.069 | 4.78 | 5.979 | 6.294 |
| 10/27/14 | 6.222 | 6.042 | 4.758 | 5.955 | 6.291 |
| 10/28/14 | 6.236 | 6.069 | 4.789 | 5.986 | 6.293 |
| 10/29/14 | 6.244 | 6.074 | 4.795 | 5.989 | 6.305 |
| 10/30/14 | 6.248 | 6.096 | 4.828 | 6.01 | 6.295 |
| 10/31/14 | 6.239 | 6.074 | 4.825 | 5.984 | 6.291 |
| 11/3/14 | 6.254 | 6.07 | 4.848 | 5.979 | 6.278 |
| 11/4/14 | 6.255 | 6.089 | 4.831 | 5.978 | 6.255 |
| 11/5/14 | 6.279 | 6.098 | 4.813 | 5.975 | 6.256 |
| 11/6/14 | 6.334 | 6.094 | 4.828 | 5.971 | 6.255 |
| 11/7/14 | 6.384 | 6.08 | 4.831 | 5.97 | 6.262 |
| 11/10/14 | 6.402 | 6.104 | 4.837 | 5.982 | 6.249 |
| 11/11/14 | 6.404 | 6.105 | 4.839 | 5.982 | 6.241 |
| 11/12/14 | 6.416 | 6.114 | 4.862 | 5.985 | 6.225 |
| 11/13/14 | 6.431 | 6.098 | 4.874 | 5.968 | 6.194 |
| 11/14/14 | 6.456 | 6.109 | 4.896 | 5.969 | 6.213 |
| 11/17/14 | 6.487 | 6.11 | 4.885 | 5.975 | 6.212 |
| 11/18/14 | 6.499 | 6.11 | 4.874 | 5.988 | 6.201 |
| 11/19/14 | 6.508 | 6.112 | 4.862 | 5.991 | 6.196 |
| 11/21/14 | 6.526 | 6.139 | 4.874 | 6.021 | 6.225 |
| 11/24/14 | 6.545 | 6.125 | 4.879 | 6.008 | 6.216 |
| 11/25/14 | 6.544 | 6.131 | 4.865 | 6.014 | 6.199 |
| 11/26/14 | 6.542 | 6.149 | 4.89 | 6.028 | 6.192 |
| 11/27/14 | 6.55 | 6.143 | 4.901 | 6.025 | 6.123 |
| 11/28/14 | 6.561 | 6.126 | 4.899 | 6.004 | 6.089 |
| 12/1/14 | 6.558 | 6.139 | 4.896 | 6.013 | 6.122 |
| 12/2/14 | 6.549 | 6.14 | 4.896 | 6.001 | 6.094 |
| 12/3/14 | 6.527 | 6.151 | 4.871 | 6.011 | 6.085 |
| 12/4/14 | 6.522 | 6.139 | 4.874 | 6.001 | 6.081 |
| 12/5/14 | 6.489 | 6.144 | 4.896 | 5.999 | 6.073 |
| 12/8/14 | 6.466 | 6.139 | 4.91 | 5.991 | 6.031 |
| 12/9/14 | 6.449 | 6.144 | 4.896 | 5.997 | 6.04 |
| 12/10/14 | 6.432 | 6.13 | 4.91 | 5.995 | 6.001 |
| 12/11/14 | 6.421 | 6.114 | 4.912 | 5.978 | 5.992 |
| 12/12/14 | 6.402 | 6.114 | 4.926 | 5.97 | 5.963 |
| 12/15/14 | 6.383 | 6.108 | 4.949 | 5.96 | 5.95 |
| 12/16/14 | 6.354 | 6.089 | 4.952 | 5.938 | 5.93 |
| 12/17/14 | 6.326 | 6.098 | 4.944 | 5.954 | 5.952 |
| 12/18/14 | 6.287 | 6.121 | 4.949 | 5.974 | 5.92 |
| 12/19/14 | 6.27 | 6.117 | 4.96 | 5.972 | 5.955 |
| 12/22/14 | 6.213 | 6.115 | 4.96 | 5.97 | 5.934 |
| 12/23/14 | 6.195 | 6.094 | 4.962 | 5.952 | 5.96 |
| 12/26/14 | 6.194 | 6.11 | 4.952 | 5.958 | 5.923 |
| 12/29/14 | 6.184 | 6.097 | 4.97 | 5.951 | 5.897 |
| 12/30/14 | 6.167 | 6.121 | 4.965 | 5.973 | 5.897 |
| 1/2/15 | 6.158 | 6.108 | 4.923 | 5.957 | 5.871 |
| 1/5/15 | 6.148 | 6.095 | 4.923 | 5.945 | 5.811 |
| 1/6/15 | 6.124 | 6.116 | 4.949 | 5.945 | 5.772 |
| 1/7/15 | 6.082 | 6.107 | 4.947 | 5.937 | 5.773 |
| 1/8/15 | 6.068 | 6.12 | 4.923 | 5.947 | 5.769 |
| 1/9/15 | 6.058 | 6.128 | 4.918 | 5.959 | 5.752 |
| 1/12/15 | 6.057 | 6.126 | 4.934 | 5.946 | 5.697 |
| 1/13/15 | 6.044 | 6.139 | 4.939 | 5.954 | 5.68 |
| 1/14/15 | 6.005 | 6.136 | 4.896 | 5.965 | 5.724 |
| 1/15/15 | 5.983 | 6.127 | 4.882 | 5.951 | 5.702 |
| 1/16/15 | 5.981 | 6.141 | 4.879 | 5.959 | 5.754 |
| 1/19/15 | 5.982 | 6.141 | 4.904 | 5.943 | 5.727 |
| 1/20/15 | 5.981 | 6.174 | 4.908 | 5.957 | 5.709 |
| 1/21/15 | 5.987 | 6.228 | 4.912 | 5.968 | 5.731 |
| 1/22/15 | 5.99 | 6.247 | 4.907 | 5.984 | 5.72 |
| 1/23/15 | 6.005 | 6.242 | 4.896 | 5.98 | 5.726 |
| 1/26/15 | 6.026 | 6.242 | 4.904 | 5.98 | 5.713 |
| 1/27/15 | 6.036 | 6.251 | 4.896 | 5.981 | 5.742 |
| 1/28/15 | 6.032 | 6.25 | 4.888 | 5.979 | 5.719 |
| 1/29/15 | 6.002 | 6.241 | 4.871 | 5.967 | 5.733 |
| 1/30/15 | 6.001 | 6.215 | 4.868 | 5.94 | 5.808 |
| 2/2/15 | 5.989 | 6.212 | 4.862 | 5.921 | 5.841 |
| 2/3/15 | 6.003 | 6.219 | 4.862 | 5.93 | 5.897 |
| 2/4/15 | 6.006 | 6.194 | 4.907 | 5.906 | 5.83 |
| 2/5/15 | 5.997 | 6.191 | 4.899 | 5.902 | 5.874 |
| 2/6/15 | 5.991 | 6.179 | 4.904 | 5.888 | 5.895 |
| 2/9/15 | 6 | 6.176 | 4.912 | 5.886 | 5.904 |
| 2/10/15 | 6.003 | 6.158 | 4.926 | 5.865 | 5.871 |
| 2/11/15 | 6.004 | 6.14 | 4.923 | 5.852 | 5.839 |
| 2/12/15 | 6.006 | 6.147 | 4.918 | 5.866 | 5.882 |
| 2/13/15 | 6.004 | 6.153 | 4.91 | 5.869 | 5.958 |
| 2/18/15 | 6.035 | 6.15 | 4.928 | 5.862 | 5.941 |
| 2/19/15 | 6.041 | 6.136 | 4.912 | 5.859 | 5.936 |
| 2/20/15 | 6.046 | 6.12 | 4.928 | 5.853 | 5.936 |
| 2/23/15 | 6.039 | 6.113 | 4.915 | 5.857 | 5.914 |
| 2/24/15 | 6.007 | 6.118 | 4.899 | 5.865 | 5.91 |
| 2/25/15 | 5.999 | 6.092 | 4.901 | 5.854 | 5.959 |
| 2/26/15 | 6.003 | 6.075 | 4.896 | 5.849 | 5.933 |
| 2/27/15 | 6.011 | 6.07 | 4.907 | 5.857 | 5.975 |
| 3/2/15 | 6.035 | 6.053 | 4.923 | 5.853 | 5.925 |
| 3/3/15 | 6.044 | 6.032 | 4.91 | 5.847 | 5.949 |
| 3/4/15 | 6.058 | 6.008 | 4.918 | 5.827 | 5.942 |
| 3/5/15 | 6.069 | 5.996 | 4.915 | 5.812 | 5.94 |
| 3/6/15 | 6.06 | 5.991 | 4.92 | 5.803 | 5.928 |
| 3/9/15 | 6.054 | 5.972 | 4.907 | 5.786 | 5.908 |
| 3/10/15 | 6.045 | 5.968 | 4.915 | 5.793 | 5.87 |
| 3/11/15 | 6.042 | 5.941 | 4.915 | 5.793 | 5.891 |
| 3/12/15 | 6.049 | 5.93 | 4.923 | 5.783 | 5.883 |
| 3/13/15 | 6.049 | 5.872 | 4.918 | 5.751 | 5.839 |
| 3/16/15 | 6.041 | 5.874 | 4.896 | 5.759 | 5.817 |
| 3/17/15 | 6.02 | 5.871 | 4.89 | 5.751 | 5.818 |
| 3/18/15 | 6.022 | 5.88 | 4.868 | 5.76 | 5.862 |
| 3/19/15 | 6.031 | 5.852 | 4.879 | 5.739 | 5.835 |
| 3/20/15 | 6.031 | 5.879 | 4.877 | 5.758 | 5.851 |
| 3/23/15 | 6.054 | 5.928 | 4.907 | 5.781 | 5.862 |
| 3/24/15 | 6.054 | 5.947 | 4.92 | 5.786 | 5.847 |
| 3/25/15 | 6.043 | 5.933 | 4.928 | 5.765 | 5.872 |
| 3/26/15 | 6.033 | 5.937 | 4.934 | 5.767 | 5.919 |
| 3/27/15 | 6.027 | 5.924 | 4.923 | 5.756 | 5.871 |
| 3/30/15 | 6.029 | 5.925 | 4.926 | 5.762 | 5.869 |
| 3/31/15 | 6.046 | 5.929 | 4.944 | 5.771 | 5.847 |
| 4/1/15 | 6.059 | 5.937 | 4.893 | 5.784 | 5.883 |
| 4/2/15 | 6.078 | 5.96 | 4.91 | 5.801 | 5.845 |
| 4/6/15 | 6.089 | 5.952 | 4.928 | 5.803 | 5.901 |
| 4/7/15 | 6.106 | 5.949 | 4.923 | 5.809 | 5.917 |
| 4/8/15 | 6.097 | 5.968 | 4.918 | 5.822 | 5.855 |
| 4/9/15 | 6.088 | 5.967 | 4.907 | 5.817 | 5.874 |
| 4/10/15 | 6.076 | 5.96 | 4.904 | 5.812 | 5.896 |
| 4/13/15 | 6.064 | 5.959 | 4.901 | 5.797 | 5.897 |
| 4/14/15 | 6.06 | 5.974 | 4.885 | 5.817 | 5.906 |
| 4/15/15 | 6.062 | 5.979 | 4.893 | 5.827 | 5.938 |
| 4/16/15 | 6.071 | 5.995 | 4.899 | 5.834 | 5.997 |
| 4/17/15 | 6.077 | 5.989 | 4.899 | 5.818 | 5.988 |
| 4/20/15 | 6.085 | 5.994 | 4.91 | 5.831 | 5.988 |
| 4/22/15 | 6.091 | 5.993 | 4.89 | 5.836 | 5.977 |
| 4/23/15 | 6.109 | 6.005 | 4.893 | 5.849 | 6.01 |
| 4/24/15 | 6.096 | 6.013 | 4.888 | 5.857 | 6.017 |
| 4/27/15 | 6.106 | 6.026 | 4.871 | 5.867 | 6.01 |
| 4/28/15 | 6.106 | 6.014 | 4.86 | 5.864 | 6.007 |
| 4/29/15 | 6.108 | 6.009 | 4.86 | 5.855 | 6.025 |
| 4/30/15 | 6.116 | 5.987 | 4.868 | 5.834 | 6.04 |
| 5/4/15 | 6.114 | 5.955 | 4.854 | 5.811 | 6.035 |
| 5/5/15 | 6.122 | 5.951 | 4.848 | 5.814 | 6.051 |
| 5/6/15 | 6.135 | 5.949 | 4.865 | 5.824 | 6.054 |
| 5/7/15 | 6.136 | 5.954 | 4.877 | 5.826 | 6.021 |
| 5/8/15 | 6.137 | 5.967 | 4.862 | 5.837 | 6.019 |
| 5/11/15 | 6.138 | 5.953 | 4.865 | 5.821 | 6.011 |
| 5/12/15 | 6.131 | 5.959 | 4.86 | 5.83 | 6.041 |
| 5/13/15 | 6.126 | 5.954 | 4.865 | 5.822 | 6.04 |
| 5/14/15 | 6.133 | 5.968 | 4.868 | 5.839 | 6.037 |
| 5/15/15 | 6.139 | 5.962 | 4.885 | 5.842 | 6.04 |
| 5/18/15 | 6.145 | 5.959 | 4.879 | 5.83 | 6.032 |
| 5/19/15 | 6.16 | 5.946 | 4.885 | 5.83 | 5.997 |
| 5/20/15 | 6.152 | 5.955 | 4.868 | 5.84 | 6.013 |
| 5/21/15 | 6.144 | 5.934 | 4.862 | 5.823 | 6.036 |
| 5/22/15 | 6.139 | 5.916 | 4.877 | 5.802 | 6.018 |
| 5/25/15 | 6.13 | 5.908 | 4.862 | 5.797 | 6.02 |
| 5/26/15 | 6.122 | 5.889 | 4.858 | 5.775 | 5.993 |
| 5/27/15 | 6.12 | 5.893 | 4.848 | 5.771 | 5.966 |
| 5/28/15 | 6.106 | 5.891 | 4.834 | 5.763 | 5.975 |
| 5/29/15 | 6.104 | 5.889 | 4.845 | 5.75 | 6.021 |
| 6/1/15 | 6.096 | 5.897 | 4.839 | 5.753 | 6.011 |
| 6/2/15 | 6.092 | 5.916 | 4.839 | 5.767 | 6.02 |
| 6/3/15 | 6.086 | 5.93 | 4.854 | 5.77 | 5.994 |
| 6/4/15 | 6.076 | 5.916 | 4.854 | 5.769 | 5.966 |
| 6/8/15 | 6.076 | 5.933 | 4.861 | 5.786 | 5.976 |
| 6/9/15 | 6.075 | 5.928 | 4.862 | 5.792 | 6.011 |
| 6/10/15 | 6.064 | 5.921 | 4.86 | 5.781 | 6.023 |
| 6/11/15 | 6.059 | 5.923 | 4.837 | 5.78 | 6.014 |
| 6/12/15 | 6.043 | 5.913 | 4.837 | 5.77 | 5.995 |
| 6/15/15 | 6.03 | 5.917 | 4.81 | 5.759 | 5.975 |
| 6/16/15 | 6.019 | 5.918 | 4.819 | 5.763 | 5.992 |
| 6/17/15 | 6.019 | 5.93 | 4.828 | 5.767 | 5.995 |
| 6/18/15 | 6.016 | 5.926 | 4.842 | 5.753 | 6.001 |
| 6/19/15 | 6.016 | 5.911 | 4.837 | 5.733 | 5.982 |
| 6/22/15 | 6.016 | 5.91 | 4.822 | 5.737 | 5.987 |
| 6/23/15 | 6.047 | 5.902 | 4.842 | 5.735 | 6.004 |
| 6/24/15 | 6.057 | 5.894 | 4.871 | 5.727 | 5.989 |
| 6/25/15 | 6.065 | 5.881 | 4.868 | 5.719 | 5.984 |
| 6/26/15 | 6.085 | 5.878 | 4.896 | 5.72 | 5.985 |
| 6/29/15 | 6.089 | 5.878 | 4.918 | 5.722 | 5.965 |
| 6/30/15 | 6.109 | 5.878 | 4.912 | 5.719 | 5.991 |
| 7/1/15 | 6.112 | 5.865 | 4.988 | 5.704 | 5.965 |
| 7/2/15 | 6.119 | 5.883 | 4.99 | 5.721 | 5.966 |
| 7/3/15 | 6.127 | 5.88 | 5 | 5.714 | 5.938 |
| 7/6/15 | 6.128 | 5.879 | 4.998 | 5.71 | 5.873 |
| 7/7/15 | 6.125 | 5.89 | 4.995 | 5.706 | 5.879 |
| 7/8/15 | 6.12 | 5.88 | 4.985 | 5.692 | 5.882 |
| 7/10/15 | 6.139 | 5.92 | 5 | 5.717 | 5.911 |
| 7/13/15 | 6.139 | 5.914 | 5.015 | 5.735 | 5.896 |
| 7/14/15 | 6.127 | 5.904 | 5.029 | 5.734 | 5.907 |
| 7/15/15 | 6.091 | 5.904 | 4.998 | 5.735 | 5.882 |
| 7/16/15 | 6.106 | 5.895 | 5.003 | 5.727 | 5.89 |
| 7/17/15 | 6.086 | 5.883 | 5.003 | 5.716 | 5.883 |
| 7/20/15 | 6.075 | 5.868 | 4.978 | 5.715 | 5.875 |
| 7/21/15 | 6.062 | 5.877 | 4.947 | 5.722 | 5.882 |
| 7/22/15 | 6.061 | 5.85 | 4.957 | 5.693 | 5.866 |
| 7/23/15 | 6.065 | 5.829 | 4.947 | 5.669 | 5.85 |
| 7/24/15 | 6.055 | 5.805 | 4.947 | 5.65 | 5.839 |
| 7/27/15 | 6.034 | 5.802 | 4.92 | 5.644 | 5.817 |
| 7/28/15 | 6.021 | 5.8 | 4.871 | 5.64 | 5.814 |
| 7/29/15 | 6.033 | 5.805 | 4.874 | 5.647 | 5.816 |
| 7/30/15 | 6.045 | 5.799 | 4.86 | 5.636 | 5.814 |
| 7/31/15 | 6.055 | 5.782 | 4.874 | 5.625 | 5.793 |
| 8/3/15 | 6.045 | 5.77 | 4.874 | 5.61 | 5.741 |
| 8/4/15 | 6.038 | 5.766 | 4.862 | 5.605 | 5.75 |
| 8/5/15 | 6.046 | 5.763 | 4.868 | 5.599 | 5.742 |
| 8/6/15 | 6.035 | 5.747 | 4.879 | 5.578 | 5.741 |
| 8/7/15 | 6.027 | 5.76 | 4.871 | 5.583 | 5.722 |
| 8/10/15 | 6.035 | 5.776 | 4.879 | 5.597 | 5.758 |
| 8/11/15 | 6.031 | 5.755 | 4.926 | 5.577 | 5.734 |
| 8/12/15 | 6.017 | 5.763 | 4.89 | 5.591 | 5.743 |
| 8/13/15 | 6.043 | 5.758 | 4.834 | 5.586 | 5.734 |
| 8/14/15 | 6.053 | 5.756 | 4.854 | 5.596 | 5.731 |
| 8/17/15 | 6.061 | 5.757 | 4.854 | 5.595 | 5.725 |
| 8/18/15 | 6.057 | 5.754 | 4.851 | 5.599 | 5.726 |
| 8/19/15 | 6.054 | 5.758 | 4.86 | 5.597 | 5.692 |
| 8/20/15 | 6.056 | 5.759 | 4.862 | 5.609 | 5.68 |
| 8/21/15 | 6.047 | 5.757 | 4.874 | 5.595 | 5.655 |
| 8/24/15 | 6.053 | 5.739 | 4.857 | 5.577 | 5.592 |
| 8/25/15 | 6.05 | 5.721 | 4.868 | 5.564 | 5.604 |
| 8/26/15 | 6.052 | 5.726 | 4.86 | 5.564 | 5.603 |
| 8/27/15 | 6.043 | 5.744 | 4.848 | 5.58 | 5.7 |
| 8/28/15 | 6.046 | 5.738 | 4.854 | 5.575 | 5.751 |
| 8/31/15 | 6.077 | 5.729 | 4.851 | 5.558 | 5.83 |
| 9/1/15 | 6.051 | 5.71 | 4.854 | 5.548 | 5.741 |
| 9/2/15 | 6.067 | 5.7 | 4.845 | 5.539 | 5.76 |
| 9/3/15 | 6.054 | 5.7 | 4.842 | 5.546 | 5.764 |
| 9/4/15 | 6.049 | 5.67 | 4.825 | 5.527 | 5.742 |
| 9/8/15 | 6.046 | 5.717 | 4.835 | 5.544 | 5.741 |
| 9/9/15 | 6.027 | 5.73 | 4.842 | 5.562 | 5.701 |
| 9/10/15 | 6.023 | 5.741 | 4.845 | 5.555 | 5.728 |
| 9/11/15 | 6.042 | 5.751 | 4.86 | 5.561 | 5.712 |
| 9/14/15 | 6.049 | 5.78 | 4.896 | 5.58 | 5.675 |
| 9/15/15 | 6.058 | 5.769 | 4.915 | 5.573 | 5.68 |
| 9/16/15 | 6.051 | 5.772 | 4.907 | 5.586 | 5.745 |
| 9/17/15 | 6.058 | 5.764 | 4.893 | 5.584 | 5.732 |
| 9/18/15 | 6.056 | 5.737 | 4.885 | 5.571 | 5.698 |
| 9/21/15 | 6.072 | 5.735 | 4.877 | 5.572 | 5.728 |
| 9/22/15 | 6.076 | 5.715 | 4.899 | 5.557 | 5.732 |
| 9/23/15 | 6.071 | 5.693 | 4.888 | 5.543 | 5.704 |
| 9/24/15 | 6.064 | 5.715 | 4.901 | 5.567 | 5.713 |
| 9/25/15 | 6.06 | 5.738 | 4.899 | 5.593 | 5.722 |
| 9/28/15 | 6.071 | 5.752 | 4.918 | 5.575 | 5.695 |
| 9/29/15 | 6.064 | 5.767 | 4.912 | 5.589 | 5.714 |
| 9/30/15 | 6.067 | 5.857 | 4.918 | 5.612 | 5.717 |
| 10/1/15 | 6.077 | 5.875 | 4.918 | 5.634 | 5.703 |
| 10/2/15 | 6.08 | 5.894 | 4.92 | 5.653 | 5.712 |
| 10/5/15 | 6.09 | 5.925 | 4.92 | 5.679 | 5.735 |
| 10/6/15 | 6.105 | 5.946 | 4.934 | 5.717 | 5.788 |
| 10/7/15 | 6.101 | 5.938 | 4.947 | 5.732 | 5.776 |
| 10/8/15 | 6.084 | 5.956 | 4.944 | 5.765 | 5.809 |
| 10/9/15 | 6.072 | 5.969 | 4.93 | 5.791 | 5.802 |
| 10/13/15 | 6.063 | 5.947 | 4.91 | 5.778 | 5.735 |
| 10/14/15 | 6.06 | 5.955 | 4.92 | 5.813 | 5.733 |
| 10/15/15 | 6.046 | 5.96 | 4.904 | 5.827 | 5.724 |
| 10/16/15 | 6.045 | 5.949 | 4.896 | 5.83 | 5.759 |
| 10/19/15 | 6.047 | 5.935 | 4.899 | 5.819 | 5.722 |
| 10/20/15 | 6.047 | 5.936 | 4.89 | 5.839 | 5.724 |
| 10/21/15 | 6.05 | 5.931 | 4.912 | 5.844 | 5.706 |
| 10/22/15 | 6.054 | 5.937 | 4.923 | 5.853 | 5.711 |
| 10/23/15 | 6.058 | 5.957 | 4.918 | 5.881 | 5.709 |
| 10/26/15 | 6.077 | 5.966 | 4.923 | 5.892 | 5.7 |
| 10/27/15 | 6.066 | 5.98 | 4.936 | 5.902 | 5.684 |
| 10/28/15 | 6.067 | 5.988 | 4.926 | 5.908 | 5.731 |
| 10/29/15 | 6.071 | 6.013 | 4.918 | 5.93 | 5.726 |
| 10/30/15 | 6.061 | 6.026 | 4.928 | 5.941 | 5.741 |
| 11/3/15 | 6.067 | 6.081 | 4.928 | 5.971 | 5.761 |
| 11/4/15 | 6.06 | 6.07 | 4.939 | 5.964 | 5.721 |
| 11/5/15 | 6.043 | 6.089 | 4.939 | 5.977 | 5.709 |
| 11/6/15 | 6.046 | 6.091 | 4.923 | 5.982 | 5.697 |
| 11/9/15 | 6.05 | 6.094 | 4.918 | 5.978 | 5.692 |
| 11/10/15 | 6.043 | 6.096 | 4.901 | 5.987 | 5.698 |
| 11/11/15 | 6.04 | 6.1 | 4.879 | 5.999 | 5.663 |
| 11/12/15 | 6.045 | 6.1 | 4.888 | 6.001 | 5.624 |
| 11/13/15 | 6.04 | 6.077 | 4.893 | 5.991 | 5.613 |
| 11/16/15 | 6.033 | 6.082 | 4.882 | 6 | 5.635 |
| 11/17/15 | 6.022 | 6.08 | 4.888 | 6.001 | 5.613 |
| 11/18/15 | 6.02 | 6.09 | 4.893 | 6.011 | 5.626 |
| 11/19/15 | 6.018 | 6.099 | 4.893 | 6.025 | 5.626 |
| 11/23/15 | 6.023 | 6.096 | 4.896 | 6.029 | 5.641 |
| 11/24/15 | 6.021 | 6.103 | 4.907 | 6.041 | 5.669 |
| 11/25/15 | 6.019 | 6.088 | 4.899 | 6.029 | 5.67 |
| 11/26/15 | 6.019 | 6.087 | 4.904 | 6.03 | 5.655 |
| 11/27/15 | 6.019 | 6.073 | 4.895 | 6.02 | 5.642 |
| 11/30/15 | 6.03 | 6.046 | 4.885 | 6 | 5.636 |
| 12/1/15 | 6.043 | 6.047 | 4.901 | 6.007 | 5.632 |
| 12/2/15 | 6.034 | 6.053 | 4.907 | 6.012 | 5.587 |
| 12/3/15 | 6.024 | 6.078 | 4.896 | 6.039 | 5.619 |
| 12/4/15 | 6.028 | 6.081 | 4.918 | 6.051 | 5.599 |
| 12/7/15 | 6.024 | 6.073 | 4.931 | 6.046 | 5.545 |
| 12/8/15 | 6.017 | 6.064 | 4.904 | 6.035 | 5.533 |
| 12/9/15 | 6.015 | 6.085 | 4.907 | 6.054 | 5.53 |
| 12/10/15 | 6.01 | 6.07 | 4.907 | 6.039 | 5.52 |
| 12/11/15 | 5.999 | 6.054 | 4.92 | 6.028 | 5.474 |
| 12/14/15 | 5.992 | 6.049 | 4.91 | 6.029 | 5.474 |
| 12/15/15 | 5.989 | 6.05 | 4.92 | 6.035 | 5.487 |
| 12/16/15 | 5.984 | 6.04 | 4.915 | 6.028 | 5.454 |
| 12/17/15 | 5.985 | 6.046 | 4.896 | 6.035 | 5.451 |
| 12/18/15 | 5.983 | 6.035 | 4.907 | 6.026 | 5.446 |
| 12/21/15 | 5.989 | 6.019 | 4.91 | 6.007 | 5.431 |
| 12/22/15 | 5.987 | 6.023 | 4.901 | 6.014 | 5.425 |
| 12/23/15 | 5.989 | 6.04 | 4.885 | 6.025 | 5.459 |
| 12/28/15 | 5.993 | 6.065 | 4.874 | 6.049 | 5.439 |
| 12/29/15 | 5.992 | 6.065 | 4.862 | 6.05 | 5.47 |
| 12/30/15 | 5.992 | 6.037 | 4.877 | 6.028 | 5.434 |
| 1/4/16 | 5.994 | 6.042 | 4.865 | 6.012 | 5.455 |
| 1/5/16 | 5.989 | 6.066 | 4.845 | 6.031 | 5.433 |
| 1/6/16 | 5.98 | 6.066 | 4.848 | 6.021 | 5.371 |
| 1/7/16 | 5.973 | 6.067 | 4.848 | 6.017 | 5.357 |
| 1/8/16 | 5.965 | 6.075 | 4.848 | 6.019 | 5.351 |
| 1/11/16 | 5.944 | 6.089 | 4.86 | 6.022 | 5.29 |
| 1/12/16 | 5.94 | 6.102 | 4.845 | 6.031 | 5.268 |
| 1/13/16 | 5.929 | 6.118 | 4.86 | 6.045 | 5.25 |
| 1/14/16 | 5.928 | 6.123 | 4.862 | 6.042 | 5.273 |
| 1/15/16 | 5.929 | 6.1 | 4.862 | 6.034 | 5.203 |
| 1/18/16 | 5.932 | 6.098 | 4.877 | 6.039 | 5.19 |
| 1/19/16 | 5.951 | 6.094 | 4.886 | 6.034 | 5.197 |
| 1/20/16 | 5.963 | 6.078 | 4.896 | 6.019 | 5.166 |
| 1/21/16 | 5.971 | 6.069 | 4.904 | 6.012 | 5.214 |
| 1/22/16 | 5.973 | 6.082 | 4.899 | 6.02 | 5.309 |
| 1/25/16 | 5.975 | 6.087 | 4.907 | 6.016 | 5.256 |
| 1/26/16 | 5.975 | 6.092 | 4.907 | 6.016 | 5.298 |
| 1/27/16 | 5.98 | 6.091 | 4.904 | 6.008 | 5.338 |
| 1/28/16 | 5.994 | 6.102 | 4.904 | 6.016 | 5.361 |
| 1/29/16 | 6.003 | 6.116 | 4.896 | 6.026 | 5.386 |
| 2/1/16 | 6.011 | 6.135 | 4.912 | 6.036 | 5.372 |
| 2/2/16 | 6.011 | 6.146 | 4.91 | 6.027 | 5.326 |
| 2/3/16 | 6.011 | 6.154 | 4.912 | 6.041 | 5.395 |
| 2/4/16 | 5.997 | 6.158 | 4.901 | 6.046 | 5.378 |
| 2/5/16 | 5.998 | 6.151 | 4.896 | 6.042 | 5.366 |
| 2/10/16 | 5.962 | 6.148 | 4.874 | 6.033 | 5.267 |
| 2/11/16 | 5.949 | 6.139 | 4.877 | 6.02 | 5.241 |
| 2/12/16 | 5.952 | 6.14 | 4.877 | 6.012 | 5.345 |
| 2/15/16 | 5.961 | 6.139 | 4.874 | 6.011 | 5.346 |
| 2/16/16 | 5.973 | 6.125 | 4.878 | 5.992 | 5.309 |
| 2/17/16 | 5.976 | 6.149 | 4.882 | 6.007 | 5.379 |
| 2/18/16 | 5.971 | 6.133 | 4.893 | 5.992 | 5.373 |
| 2/19/16 | 5.983 | 6.141 | 4.89 | 5.991 | 5.335 |
| 2/22/16 | 5.993 | 6.168 | 4.885 | 6.019 | 5.385 |
| 2/23/16 | 5.991 | 6.168 | 4.89 | 6.011 | 5.343 |
| 2/24/16 | 5.987 | 6.165 | 4.874 | 6.005 | 5.376 |
| 2/25/16 | 5.989 | 6.173 | 4.868 | 6.003 | 5.402 |
| 2/26/16 | 5.987 | 6.153 | 4.86 | 5.991 | 5.396 |
| 2/29/16 | 5.983 | 6.16 | 4.857 | 5.985 | 5.421 |
| 3/1/16 | 5.973 | 6.176 | 4.848 | 5.993 | 5.444 |
| 3/2/16 | 5.963 | 6.187 | 4.845 | 6.005 | 5.447 |
| 3/3/16 | 5.959 | 6.211 | 4.845 | 6.022 | 5.451 |
| 3/4/16 | 5.971 | 6.212 | 4.848 | 6.031 | 5.494 |
| 3/7/16 | 5.96 | 6.22 | 4.851 | 6.024 | 5.548 |
| 3/8/16 | 5.957 | 6.222 | 4.854 | 6.033 | 5.518 |
| 3/9/16 | 5.964 | 6.237 | 4.86 | 6.045 | 5.553 |
| 3/10/16 | 5.972 | 6.253 | 4.857 | 6.064 | 5.528 |
| 3/11/16 | 5.98 | 6.266 | 4.868 | 6.068 | 5.537 |
| 3/14/16 | 5.992 | 6.256 | 4.874 | 6.058 | 5.515 |
| 3/15/16 | 5.998 | 6.222 | 4.885 | 6.024 | 5.495 |
| 3/16/16 | 6 | 6.21 | 4.885 | 6.018 | 5.535 |
| 3/17/16 | 5.998 | 6.231 | 4.888 | 6.041 | 5.565 |
| 3/18/16 | 6.001 | 6.241 | 4.89 | 6.052 | 5.557 |
| 3/21/16 | 5.994 | 6.226 | 4.885 | 6.051 | 5.565 |
| 3/22/16 | 5.987 | 6.216 | 4.893 | 6.055 | 5.571 |
| 3/23/16 | 5.992 | 6.184 | 4.893 | 6.03 | 5.539 |
| 3/24/16 | 5.997 | 6.171 | 4.885 | 6.032 | 5.538 |
| 3/28/16 | 6.006 | 6.16 | 4.888 | 6.048 | 5.534 |
| 3/29/16 | 6.013 | 6.118 | 4.896 | 6.045 | 5.505 |
| 3/30/16 | 6.021 | 6.076 | 4.901 | 6.049 | 5.508 |
| 3/31/16 | 6.022 | 6.051 | 4.885 | 6.053 | 5.517 |
| 4/1/16 | 6.018 | 6.046 | 4.842 | 6.062 | 5.493 |
| 4/4/16 | 6.033 | 5.998 | 4.848 | 6.05 | 5.468 |
| 4/5/16 | 6.034 | 5.941 | 4.851 | 6.033 | 5.472 |
| 4/6/16 | 6.043 | 5.904 | 4.857 | 6.035 | 5.523 |
| 4/7/16 | 6.047 | 5.886 | 4.86 | 6.025 | 5.513 |
| 4/8/16 | 6.049 | 5.902 | 4.871 | 6.046 | 5.574 |
| 4/11/16 | 6.054 | 5.932 | 4.871 | 6.07 | 5.595 |
| 4/12/16 | 6.056 | 5.921 | 4.857 | 6.068 | 5.638 |
| 4/13/16 | 6.072 | 5.932 | 4.874 | 6.075 | 5.626 |
| 4/14/16 | 6.062 | 5.932 | 4.904 | 6.074 | 5.619 |
| 4/15/16 | 6.058 | 5.928 | 4.904 | 6.068 | 5.602 |
| 4/18/16 | 6.067 | 5.896 | 4.912 | 6.051 | 5.597 |
| 4/19/16 | 6.07 | 5.921 | 4.912 | 6.064 | 5.623 |
| 4/20/16 | 6.075 | 5.913 | 4.923 | 6.06 | 5.662 |
| 4/22/16 | 6.072 | 5.894 | 4.907 | 6.051 | 5.647 |
| 4/25/16 | 6.074 | 5.897 | 4.871 | 6.063 | 5.633 |
| 4/26/16 | 6.085 | 5.903 | 4.885 | 6.07 | 5.661 |
| 4/27/16 | 6.082 | 5.906 | 4.899 | 6.066 | 5.692 |
| 4/28/16 | 6.075 | 5.907 | 4.896 | 6.067 | 5.712 |
| 4/29/16 | 6.075 | 5.923 | 4.912 | 6.08 | 5.712 |
| 5/2/16 | 6.079 | 5.897 | 4.926 | 6.069 | 5.663 |
| 5/3/16 | 6.065 | 5.872 | 4.926 | 6.04 | 5.644 |
| 5/4/16 | 6.058 | 5.88 | 4.893 | 6.053 | 5.636 |
| 5/5/16 | 6.05 | 5.874 | 4.885 | 6.049 | 5.645 |
| 5/6/16 | 6.041 | 5.885 | 4.877 | 6.065 | 5.653 |
| 5/9/16 | 6.052 | 5.901 | 4.888 | 6.06 | 5.614 |
| 5/10/16 | 6.066 | 5.919 | 4.865 | 6.072 | 5.656 |
| 5/11/16 | 6.072 | 5.944 | 4.899 | 6.079 | 5.701 |
| 5/12/16 | 6.07 | 5.952 | 4.89 | 6.071 | 5.711 |
| 5/13/16 | 6.081 | 5.942 | 4.92 | 6.053 | 5.706 |
| 5/16/16 | 6.1 | 5.953 | 4.926 | 6.067 | 5.729 |
| 5/17/16 | 6.09 | 5.957 | 4.934 | 6.07 | 5.736 |
| 5/18/16 | 6.118 | 5.939 | 4.942 | 6.053 | 5.729 |
| 5/19/16 | 6.111 | 5.942 | 4.949 | 6.051 | 5.726 |
| 5/20/16 | 6.113 | 5.947 | 4.923 | 6.063 | 5.724 |
| 5/23/16 | 6.117 | 5.968 | 4.936 | 6.055 | 5.717 |
| 5/24/16 | 6.132 | 5.968 | 4.944 | 6.051 | 5.722 |
| 5/25/16 | 6.141 | 5.978 | 4.944 | 6.049 | 5.745 |
| 5/27/16 | 6.159 | 5.979 | 4.968 | 6.049 | 5.736 |
| 5/31/16 | 6.159 | 6 | 4.98 | 6.057 | 5.744 |
| 6/1/16 | 6.155 | 6.016 | 4.962 | 6.067 | 5.745 |
| 6/2/16 | 6.167 | 6.019 | 4.988 | 6.079 | 5.751 |
| 6/3/16 | 6.167 | 6.037 | 4.99 | 6.105 | 5.743 |
| 6/6/16 | 6.175 | 6.059 | 4.998 | 6.125 | 5.761 |
| 6/7/16 | 6.173 | 6.078 | 5.02 | 6.142 | 5.779 |
| 6/8/16 | 6.171 | 6.088 | 5.022 | 6.174 | 5.799 |
| 6/9/16 | 6.152 | 6.07 | 5.029 | 6.184 | 5.788 |
| 6/10/16 | 6.151 | 6.051 | 5.02 | 6.178 | 5.761 |
| 6/13/16 | 6.166 | 6.024 | 5.01 | 6.169 | 5.757 |
| 6/14/16 | 6.172 | 6.012 | 5.027 | 6.178 | 5.747 |
| 6/15/16 | 6.168 | 6.008 | 5.044 | 6.187 | 5.729 |
| 6/16/16 | 6.165 | 6.001 | 5.025 | 6.193 | 5.692 |
| 6/17/16 | 6.168 | 6.009 | 5.015 | 6.211 | 5.733 |
| 6/20/16 | 6.163 | 6.023 | 5.046 | 6.228 | 5.763 |
| 6/21/16 | 6.152 | 6.02 | 5.005 | 6.232 | 5.762 |
| 6/22/16 | 6.141 | 6.02 | 4.942 | 6.24 | 5.748 |
| 6/23/16 | 6.135 | 6.028 | 4.934 | 6.252 | 5.768 |
| 6/24/16 | 6.13 | 6.018 | 4.918 | 6.25 | 5.718 |
| 6/27/16 | 6.136 | 6.013 | 4.912 | 6.242 | 5.692 |
| 6/28/16 | 6.137 | 6.033 | 4.912 | 6.274 | 5.721 |
| 6/29/16 | 6.141 | 6.058 | 4.912 | 6.3 | 5.762 |
| 6/30/16 | 6.143 | 6.063 | 4.879 | 6.304 | 5.744 |
| 7/1/16 | 6.135 | 6.056 | 4.854 | 6.299 | 5.757 |
| 7/4/16 | 6.136 | 6.044 | 4.837 | 6.29 | 5.752 |
| 7/5/16 | 6.132 | 6.033 | 4.828 | 6.282 | 5.709 |
| 7/6/16 | 6.118 | 6.017 | 4.81 | 6.265 | 5.726 |
| 7/7/16 | 6.116 | 6.019 | 4.786 | 6.258 | 5.675 |
| 7/8/16 | 6.125 | 6.042 | 4.786 | 6.271 | 5.683 |
| 7/11/16 | 6.129 | 6.032 | 4.825 | 6.264 | 5.672 |
| 7/12/16 | 6.134 | 6.038 | 4.804 | 6.262 | 5.719 |
| 7/13/16 | 6.132 | 6.052 | 4.816 | 6.265 | 5.672 |
| 7/14/16 | 6.127 | 6.074 | 4.845 | 6.272 | 5.696 |
| 7/15/16 | 6.1 | 6.091 | 4.837 | 6.276 | 5.701 |
| 7/18/16 | 6.103 | 6.11 | 4.822 | 6.27 | 5.687 |
| 7/19/16 | 6.095 | 6.116 | 4.837 | 6.271 | 5.681 |
| 7/20/16 | 6.072 | 6.119 | 4.801 | 6.273 | 5.692 |
| 7/21/16 | 6.066 | 6.114 | 4.789 | 6.268 | 5.671 |
| 7/22/16 | 6.048 | 6.125 | 4.776 | 6.277 | 5.66 |
| 7/25/16 | 6.043 | 6.115 | 4.78 | 6.263 | 5.639 |
| 7/26/16 | 6.043 | 6.117 | 4.786 | 6.265 | 5.642 |
| 7/27/16 | 6.028 | 6.133 | 4.786 | 6.264 | 5.61 |
| 7/28/16 | 6.02 | 6.121 | 4.795 | 6.26 | 5.592 |
| 7/29/16 | 6.013 | 6.138 | 4.78 | 6.273 | 5.587 |
| 8/1/16 | 6.022 | 6.133 | 4.792 | 6.257 | 5.579 |
| 8/2/16 | 6.006 | 6.131 | 4.764 | 6.258 | 5.571 |
| 8/3/16 | 5.989 | 6.147 | 4.758 | 6.267 | 5.602 |
| 8/4/16 | 5.989 | 6.159 | 4.761 | 6.284 | 5.629 |
| 8/5/16 | 5.993 | 6.168 | 4.748 | 6.294 | 5.628 |
| 8/8/16 | 6.005 | 6.172 | 4.758 | 6.293 | 5.653 |
| 8/9/16 | 5.99 | 6.181 | 4.761 | 6.303 | 5.644 |
| 8/10/16 | 5.986 | 6.185 | 4.751 | 6.31 | 5.623 |
| 8/11/16 | 5.986 | 6.177 | 4.755 | 6.303 | 5.668 |
| 8/12/16 | 5.987 | 6.152 | 4.748 | 6.29 | 5.688 |
| 8/15/16 | 5.998 | 6.159 | 4.751 | 6.295 | 5.717 |
| 8/16/16 | 6.003 | 6.157 | 4.767 | 6.297 | 5.735 |
| 8/17/16 | 6.003 | 6.147 | 4.77 | 6.284 | 5.747 |
| 8/18/16 | 6.01 | 6.135 | 4.776 | 6.271 | 5.768 |
| 8/19/16 | 6.015 | 6.146 | 4.783 | 6.279 | 5.768 |
| 8/22/16 | 6.024 | 6.145 | 4.789 | 6.283 | 5.733 |
| 8/23/16 | 6.018 | 6.143 | 4.786 | 6.278 | 5.749 |
| 8/24/16 | 6.009 | 6.133 | 4.773 | 6.282 | 5.731 |
| 8/25/16 | 6.006 | 6.134 | 4.77 | 6.277 | 5.744 |
| 8/26/16 | 6.005 | 6.117 | 4.758 | 6.274 | 5.749 |
| 8/29/16 | 6.001 | 6.128 | 4.732 | 6.279 | 5.735 |
| 8/30/16 | 6 | 6.13 | 4.719 | 6.278 | 5.717 |
| 8/31/16 | 5.999 | 6.149 | 4.693 | 6.28 | 5.689 |
| 9/1/16 | 6.013 | 6.143 | 4.693 | 6.277 | 5.655 |
| 9/2/16 | 6.035 | 6.147 | 4.719 | 6.269 | 5.685 |
| 9/5/16 | 6.039 | 6.15 | 4.735 | 6.265 | 5.702 |
| 9/6/16 | 6.038 | 6.178 | 4.735 | 6.282 | 5.694 |
| 9/8/16 | 6.042 | 6.172 | 4.748 | 6.29 | 5.75 |
| 9/9/16 | 6.059 | 6.155 | 4.773 | 6.268 | 5.71 |
| 9/12/16 | 6.076 | 6.161 | 4.783 | 6.28 | 5.716 |
| 9/13/16 | 6.073 | 6.146 | 4.78 | 6.26 | 5.69 |
| 9/14/16 | 6.071 | 6.147 | 4.742 | 6.243 | 5.664 |
| 9/15/16 | 6.073 | 6.171 | 4.742 | 6.257 | 5.68 |
| 9/16/16 | 6.07 | 6.191 | 4.732 | 6.265 | 5.662 |
| 9/19/16 | 6.07 | 6.2 | 4.755 | 6.27 | 5.666 |
| 9/20/16 | 6.069 | 6.223 | 4.755 | 6.276 | 5.664 |
| 9/21/16 | 6.066 | 6.233 | 4.767 | 6.292 | 5.685 |
| 9/22/16 | 6.077 | 6.238 | 4.764 | 6.306 | 5.702 |
| 9/23/16 | 6.081 | 6.233 | 4.755 | 6.306 | 5.664 |
| 9/26/16 | 6.084 | 6.233 | 4.755 | 6.308 | 5.696 |
| 9/26/16 | 6.084 | 6.233 | 4.755 | 6.308 | 5.696 |
| 9/27/16 | 6.093 | 6.247 | 4.729 | 6.323 | 5.666 |
| 9/27/16 | 6.093 | 6.247 | 4.729 | 6.323 | 5.666 |
| 9/28/16 | 6.088 | 6.248 | 4.739 | 6.341 | 5.724 |
| 9/28/16 | 6.088 | 6.248 | 4.739 | 6.341 | 5.724 |
| 9/29/16 | 6.084 | 6.24 | 4.729 | 6.364 | 5.735 |
| 9/29/16 | 6.084 | 6.24 | 4.729 | 6.364 | 5.735 |
| 9/30/16 | 6.08 | 6.242 | 4.726 | 6.368 | 5.731 |
| 9/30/16 | 6.08 | 6.242 | 4.726 | 6.368 | 5.731 |
| 10/3/16 | 6.084 | 6.263 | 4.751 | 6.378 | 5.768 |
| 10/3/16 | 6.084 | 6.263 | 4.751 | 6.378 | 5.768 |
| 10/4/16 | 6.089 | 6.253 | 4.776 | 6.363 | 5.767 |
| 10/4/16 | 6.089 | 6.253 | 4.776 | 6.363 | 5.767 |
| 10/5/16 | 6.095 | 6.265 | 4.783 | 6.381 | 5.787 |
| 10/5/16 | 6.095 | 6.265 | 4.783 | 6.381 | 5.787 |
| 10/6/16 | 6.095 | 6.282 | 4.783 | 6.384 | 5.799 |
| 10/6/16 | 6.095 | 6.282 | 4.783 | 6.384 | 5.799 |
| 10/7/16 | 6.093 | 6.3 | 4.761 | 6.397 | 5.788 |
| 10/7/16 | 6.093 | 6.3 | 4.761 | 6.397 | 5.788 |
| 10/10/16 | 6.105 | 6.321 | 4.758 | 6.4 | 5.811 |
| 10/10/16 | 6.105 | 6.321 | 4.758 | 6.4 | 5.811 |
| 10/11/16 | 6.119 | 6.331 | 4.764 | 6.408 | 5.797 |
| 10/11/16 | 6.119 | 6.331 | 4.764 | 6.408 | 5.797 |
| 10/13/16 | 6.111 | 6.373 | 4.755 | 6.414 | 5.79 |
| 10/13/16 | 6.111 | 6.373 | 4.755 | 6.414 | 5.79 |
| 10/14/16 | 6.117 | 6.367 | 4.801 | 6.412 | 5.788 |
| 10/14/16 | 6.117 | 6.367 | 4.801 | 6.412 | 5.788 |
| 10/17/16 | 6.121 | 6.366 | 4.813 | 6.419 | 5.78 |
| 10/17/16 | 6.121 | 6.366 | 4.813 | 6.419 | 5.78 |
| 10/18/16 | 6.126 | 6.372 | 4.819 | 6.427 | 5.783 |
| 10/18/16 | 6.126 | 6.372 | 4.819 | 6.427 | 5.783 |
| 10/19/16 | 6.13 | 6.368 | 4.828 | 6.434 | 5.802 |
| 10/19/16 | 6.13 | 6.368 | 4.828 | 6.434 | 5.802 |
| 10/20/16 | 6.13 | 6.376 | 4.839 | 6.443 | 5.777 |
| 10/20/16 | 6.13 | 6.376 | 4.839 | 6.443 | 5.777 |
| 10/21/16 | 6.134 | 6.368 | 4.819 | 6.431 | 5.785 |
| 10/21/16 | 6.134 | 6.368 | 4.819 | 6.431 | 5.785 |
| 10/24/16 | 6.142 | 6.385 | 4.825 | 6.457 | 5.779 |
| 10/24/16 | 6.142 | 6.385 | 4.825 | 6.457 | 5.779 |
| 10/25/16 | 6.137 | 6.384 | 4.81 | 6.47 | 5.766 |
| 10/25/16 | 6.137 | 6.384 | 4.81 | 6.47 | 5.766 |
| 10/26/16 | 6.143 | 6.369 | 4.813 | 6.462 | 5.75 |
| 10/26/16 | 6.143 | 6.369 | 4.813 | 6.462 | 5.75 |
| 10/27/16 | 6.144 | 6.368 | 4.828 | 6.459 | 5.76 |
| 10/27/16 | 6.144 | 6.368 | 4.828 | 6.459 | 5.76 |
| 10/28/16 | 6.143 | 6.355 | 4.839 | 6.448 | 5.744 |
| 10/28/16 | 6.143 | 6.355 | 4.839 | 6.448 | 5.744 |
| 10/31/16 | 6.149 | 6.353 | 4.831 | 6.451 | 5.716 |
| 10/31/16 | 6.149 | 6.353 | 4.831 | 6.451 | 5.716 |
| 11/1/16 | 6.146 | 6.338 | 4.831 | 6.432 | 5.712 |
| 11/1/16 | 6.146 | 6.338 | 4.831 | 6.432 | 5.712 |
| 11/3/16 | 6.126 | 6.337 | 4.807 | 6.429 | 5.674 |
| 11/3/16 | 6.126 | 6.337 | 4.807 | 6.429 | 5.674 |
| 11/4/16 | 6.131 | 6.345 | 4.813 | 6.437 | 5.658 |
| 11/4/16 | 6.131 | 6.345 | 4.813 | 6.437 | 5.658 |
| 11/7/16 | 6.136 | 6.349 | 4.816 | 6.443 | 5.67 |
| 11/7/16 | 6.136 | 6.349 | 4.816 | 6.443 | 5.67 |
| 11/8/16 | 6.13 | 6.357 | 4.807 | 6.45 | 5.668 |
| 11/8/16 | 6.13 | 6.357 | 4.807 | 6.45 | 5.668 |
| 11/9/16 | 6.123 | 6.343 | 4.831 | 6.433 | 5.675 |
| 11/9/16 | 6.123 | 6.343 | 4.831 | 6.433 | 5.675 |
| 11/10/16 | 6.113 | 6.293 | 4.792 | 6.386 | 5.663 |
| 11/10/16 | 6.113 | 6.293 | 4.792 | 6.386 | 5.663 |
| 11/11/16 | 6.109 | 6.279 | 4.801 | 6.375 | 5.639 |
| 11/11/16 | 6.109 | 6.279 | 4.801 | 6.375 | 5.639 |
| 11/14/16 | 6.112 | 6.274 | 4.795 | 6.357 | 5.632 |
| 11/14/16 | 6.112 | 6.274 | 4.795 | 6.357 | 5.632 |
| 11/16/16 | 6.099 | 6.269 | 4.801 | 6.358 | 5.68 |
| 11/16/16 | 6.099 | 6.269 | 4.801 | 6.358 | 5.68 |
| 11/17/16 | 6.102 | 6.272 | 4.792 | 6.355 | 5.677 |
| 11/17/16 | 6.102 | 6.272 | 4.792 | 6.355 | 5.677 |
| 11/18/16 | 6.12 | 6.279 | 4.804 | 6.361 | 5.685 |
| 11/18/16 | 6.12 | 6.279 | 4.804 | 6.361 | 5.685 |
| 11/21/16 | 6.138 | 6.285 | 4.819 | 6.366 | 5.728 |
| 11/21/16 | 6.138 | 6.285 | 4.819 | 6.366 | 5.728 |
| 11/22/16 | 6.141 | 6.282 | 4.831 | 6.352 | 5.732 |
| 11/22/16 | 6.141 | 6.282 | 4.831 | 6.352 | 5.732 |
| 11/23/16 | 6.146 | 6.269 | 4.837 | 6.339 | 5.729 |
| 11/23/16 | 6.146 | 6.269 | 4.837 | 6.339 | 5.729 |
| 11/24/16 | 6.149 | 6.269 | 4.837 | 6.333 | 5.73 |
| 11/24/16 | 6.149 | 6.269 | 4.837 | 6.333 | 5.73 |
| 11/25/16 | 6.149 | 6.26 | 4.834 | 6.323 | 5.693 |
| 11/25/16 | 6.149 | 6.26 | 4.834 | 6.323 | 5.693 |
| 11/28/16 | 6.147 | 6.265 | 4.831 | 6.335 | 5.714 |
| 11/28/16 | 6.147 | 6.265 | 4.831 | 6.335 | 5.714 |
| 11/29/16 | 6.137 | 6.26 | 4.831 | 6.321 | 5.675 |
| 11/29/16 | 6.137 | 6.26 | 4.831 | 6.321 | 5.675 |
| 11/30/16 | 6.144 | 6.26 | 4.789 | 6.325 | 5.76 |
| 11/30/16 | 6.144 | 6.26 | 4.789 | 6.325 | 5.76 |
| 12/1/16 | 6.153 | 6.237 | 4.789 | 6.294 | 5.826 |
| 12/1/16 | 6.153 | 6.237 | 4.789 | 6.294 | 5.826 |
| 12/2/16 | 6.156 | 6.241 | 4.767 | 6.3 | 5.836 |
| 12/2/16 | 6.156 | 6.241 | 4.767 | 6.3 | 5.836 |
| 12/5/16 | 6.164 | 6.251 | 4.786 | 6.304 | 5.844 |
| 12/5/16 | 6.164 | 6.251 | 4.786 | 6.304 | 5.844 |
| 12/6/16 | 6.172 | 6.286 | 4.816 | 6.31 | 5.826 |
| 12/6/16 | 6.172 | 6.286 | 4.816 | 6.31 | 5.826 |
| 12/7/16 | 6.176 | 6.291 | 4.828 | 6.307 | 5.808 |
| 12/7/16 | 6.176 | 6.291 | 4.828 | 6.307 | 5.808 |
| 12/8/16 | 6.182 | 6.295 | 4.819 | 6.31 | 5.825 |
| 12/8/16 | 6.182 | 6.295 | 4.819 | 6.31 | 5.825 |
| 12/9/16 | 6.202 | 6.304 | 4.807 | 6.312 | 5.833 |
| 12/9/16 | 6.202 | 6.304 | 4.807 | 6.312 | 5.833 |
| 12/12/16 | 6.253 | 6.305 | 4.825 | 6.317 | 5.858 |
| 12/12/16 | 6.253 | 6.305 | 4.825 | 6.317 | 5.858 |
| 12/13/16 | 6.268 | 6.317 | 4.828 | 6.316 | 5.858 |
| 12/13/16 | 6.268 | 6.317 | 4.828 | 6.316 | 5.858 |
| 12/14/16 | 6.252 | 6.302 | 4.831 | 6.308 | 5.825 |
| 12/14/16 | 6.252 | 6.302 | 4.831 | 6.308 | 5.825 |
| 12/15/16 | 6.233 | 6.287 | 4.834 | 6.304 | 5.827 |
| 12/15/16 | 6.233 | 6.287 | 4.834 | 6.304 | 5.827 |
| 12/16/16 | 6.224 | 6.281 | 4.825 | 6.296 | 5.849 |
| 12/16/16 | 6.224 | 6.281 | 4.825 | 6.296 | 5.849 |
| 12/19/16 | 6.229 | 6.287 | 4.822 | 6.295 | 5.844 |
| 12/19/16 | 6.229 | 6.287 | 4.822 | 6.295 | 5.844 |
| 12/20/16 | 6.22 | 6.286 | 4.813 | 6.303 | 5.852 |
| 12/20/16 | 6.22 | 6.286 | 4.813 | 6.303 | 5.852 |
| 12/21/16 | 6.194 | 6.296 | 4.804 | 6.302 | 5.836 |
| 12/21/16 | 6.194 | 6.296 | 4.804 | 6.302 | 5.836 |
| 12/22/16 | 6.181 | 6.306 | 4.795 | 6.309 | 5.846 |
| 12/22/16 | 6.181 | 6.306 | 4.795 | 6.309 | 5.846 |
| 12/23/16 | 6.177 | 6.313 | 4.795 | 6.319 | 5.848 |
| 12/23/16 | 6.177 | 6.313 | 4.795 | 6.319 | 5.848 |
| 12/27/16 | 6.172 | 6.311 | 4.792 | 6.323 | 5.865 |
| 12/27/16 | 6.172 | 6.311 | 4.792 | 6.323 | 5.865 |
| 12/28/16 | 6.166 | 6.311 | 4.819 | 6.314 | 5.867 |
| 12/28/16 | 6.166 | 6.311 | 4.819 | 6.314 | 5.867 |
| 12/29/16 | 6.183 | 6.324 | 4.804 | 6.321 | 5.866 |
| 12/29/16 | 6.183 | 6.324 | 4.804 | 6.321 | 5.866 |